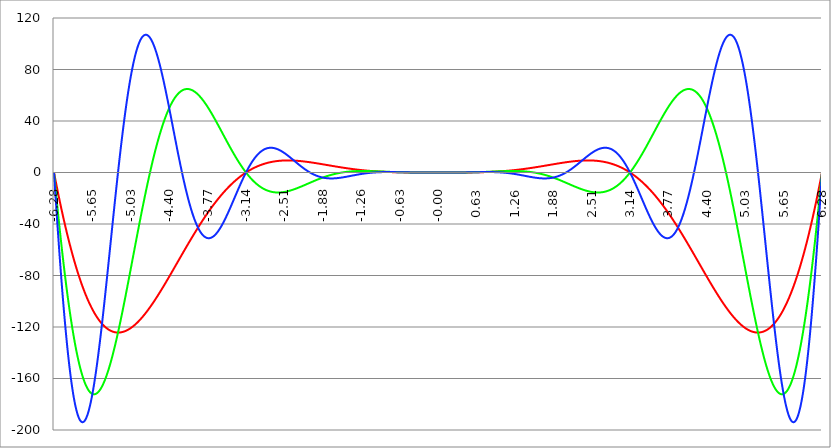
| Category | Series 1 | Series 0 | Series 2 |
|---|---|---|---|
| -6.283185307179586 | 0 | 0 | 0 |
| -6.276902121872407 | -1.554 | -3.108 | -4.661 |
| -6.270618936565228 | -3.098 | -6.196 | -9.293 |
| -6.264335751258049 | -4.633 | -9.265 | -13.894 |
| -6.25805256595087 | -6.159 | -12.314 | -18.462 |
| -6.25176938064369 | -7.675 | -15.343 | -22.995 |
| -6.245486195336511 | -9.182 | -18.351 | -27.493 |
| -6.23920301002933 | -10.679 | -21.337 | -31.954 |
| -6.232919824722153 | -12.166 | -24.302 | -36.376 |
| -6.226636639414973 | -13.644 | -27.245 | -40.759 |
| -6.220353454107794 | -15.113 | -30.166 | -45.099 |
| -6.214070268800615 | -16.571 | -33.063 | -49.398 |
| -6.207787083493435 | -18.02 | -35.938 | -53.652 |
| -6.201503898186257 | -19.459 | -38.789 | -57.86 |
| -6.195220712879077 | -20.889 | -41.617 | -62.022 |
| -6.188937527571898 | -22.309 | -44.42 | -66.136 |
| -6.182654342264719 | -23.719 | -47.198 | -70.201 |
| -6.17637115695754 | -25.119 | -49.952 | -74.215 |
| -6.170087971650361 | -26.509 | -52.68 | -78.178 |
| -6.163804786343182 | -27.89 | -55.383 | -82.088 |
| -6.157521601036002 | -29.261 | -58.06 | -85.943 |
| -6.151238415728823 | -30.621 | -60.711 | -89.744 |
| -6.144955230421644 | -31.972 | -63.335 | -93.489 |
| -6.138672045114464 | -33.313 | -65.932 | -97.176 |
| -6.132388859807286 | -34.644 | -68.502 | -100.806 |
| -6.126105674500106 | -35.965 | -71.045 | -104.376 |
| -6.119822489192927 | -37.277 | -73.561 | -107.886 |
| -6.113539303885748 | -38.578 | -76.048 | -111.335 |
| -6.107256118578569 | -39.869 | -78.507 | -114.721 |
| -6.10097293327139 | -41.15 | -80.937 | -118.045 |
| -6.09468974796421 | -42.421 | -83.339 | -121.305 |
| -6.088406562657031 | -43.682 | -85.712 | -124.501 |
| -6.082123377349852 | -44.933 | -88.056 | -127.631 |
| -6.075840192042672 | -46.174 | -90.37 | -130.694 |
| -6.069557006735494 | -47.405 | -92.654 | -133.691 |
| -6.063273821428314 | -48.625 | -94.909 | -136.621 |
| -6.056990636121135 | -49.836 | -97.133 | -139.482 |
| -6.050707450813956 | -51.037 | -99.327 | -142.274 |
| -6.044424265506777 | -52.227 | -101.491 | -144.996 |
| -6.038141080199597 | -53.407 | -103.623 | -147.648 |
| -6.031857894892418 | -54.577 | -105.725 | -150.23 |
| -6.025574709585239 | -55.737 | -107.796 | -152.74 |
| -6.01929152427806 | -56.887 | -109.835 | -155.179 |
| -6.013008338970881 | -58.027 | -111.843 | -157.545 |
| -6.006725153663701 | -59.156 | -113.82 | -159.839 |
| -6.000441968356522 | -60.275 | -115.764 | -162.06 |
| -5.994158783049343 | -61.385 | -117.677 | -164.207 |
| -5.987875597742164 | -62.483 | -119.557 | -166.281 |
| -5.981592412434984 | -63.572 | -121.406 | -168.28 |
| -5.975309227127805 | -64.651 | -123.222 | -170.205 |
| -5.969026041820626 | -65.719 | -125.005 | -172.055 |
| -5.962742856513447 | -66.778 | -126.757 | -173.831 |
| -5.956459671206268 | -67.826 | -128.475 | -175.531 |
| -5.950176485899088 | -68.863 | -130.161 | -177.156 |
| -5.94389330059191 | -69.891 | -131.813 | -178.706 |
| -5.93761011528473 | -70.909 | -133.433 | -180.181 |
| -5.931326929977551 | -71.916 | -135.02 | -181.579 |
| -5.925043744670372 | -72.913 | -136.573 | -182.903 |
| -5.918760559363193 | -73.9 | -138.094 | -184.15 |
| -5.912477374056014 | -74.877 | -139.581 | -185.322 |
| -5.906194188748834 | -75.843 | -141.035 | -186.418 |
| -5.899911003441655 | -76.8 | -142.455 | -187.439 |
| -5.893627818134476 | -77.746 | -143.842 | -188.385 |
| -5.887344632827297 | -78.682 | -145.196 | -189.255 |
| -5.881061447520117 | -79.608 | -146.516 | -190.05 |
| -5.874778262212938 | -80.524 | -147.803 | -190.77 |
| -5.868495076905759 | -81.43 | -149.056 | -191.415 |
| -5.86221189159858 | -82.326 | -150.276 | -191.985 |
| -5.855928706291401 | -83.211 | -151.462 | -192.482 |
| -5.849645520984221 | -84.087 | -152.614 | -192.904 |
| -5.843362335677042 | -84.952 | -153.734 | -193.253 |
| -5.837079150369863 | -85.807 | -154.819 | -193.528 |
| -5.830795965062684 | -86.652 | -155.871 | -193.73 |
| -5.824512779755505 | -87.487 | -156.89 | -193.86 |
| -5.818229594448325 | -88.312 | -157.875 | -193.917 |
| -5.811946409141146 | -89.127 | -158.826 | -193.903 |
| -5.805663223833967 | -89.932 | -159.745 | -193.818 |
| -5.799380038526788 | -90.727 | -160.63 | -193.661 |
| -5.793096853219609 | -91.512 | -161.481 | -193.435 |
| -5.78681366791243 | -92.287 | -162.3 | -193.138 |
| -5.780530482605251 | -93.053 | -163.085 | -192.773 |
| -5.774247297298071 | -93.808 | -163.837 | -192.338 |
| -5.767964111990892 | -94.553 | -164.557 | -191.836 |
| -5.761680926683713 | -95.288 | -165.243 | -191.267 |
| -5.755397741376534 | -96.013 | -165.896 | -190.63 |
| -5.749114556069355 | -96.729 | -166.517 | -189.928 |
| -5.742831370762175 | -97.434 | -167.105 | -189.16 |
| -5.736548185454996 | -98.13 | -167.661 | -188.328 |
| -5.730265000147816 | -98.816 | -168.184 | -187.431 |
| -5.723981814840638 | -99.492 | -168.675 | -186.472 |
| -5.717698629533459 | -100.159 | -169.133 | -185.45 |
| -5.711415444226279 | -100.815 | -169.56 | -184.366 |
| -5.7051322589191 | -101.462 | -169.955 | -183.221 |
| -5.698849073611921 | -102.099 | -170.317 | -182.017 |
| -5.692565888304742 | -102.726 | -170.648 | -180.753 |
| -5.686282702997562 | -103.344 | -170.948 | -179.431 |
| -5.679999517690383 | -103.952 | -171.216 | -178.052 |
| -5.673716332383204 | -104.551 | -171.453 | -176.616 |
| -5.667433147076025 | -105.139 | -171.659 | -175.124 |
| -5.661149961768846 | -105.719 | -171.834 | -173.578 |
| -5.654866776461667 | -106.288 | -171.978 | -171.978 |
| -5.648583591154487 | -106.849 | -172.092 | -170.325 |
| -5.642300405847308 | -107.399 | -172.175 | -168.621 |
| -5.63601722054013 | -107.94 | -172.228 | -166.865 |
| -5.62973403523295 | -108.472 | -172.251 | -165.06 |
| -5.623450849925771 | -108.994 | -172.245 | -163.206 |
| -5.617167664618591 | -109.507 | -172.208 | -161.304 |
| -5.610884479311412 | -110.01 | -172.142 | -159.355 |
| -5.604601294004233 | -110.505 | -172.047 | -157.36 |
| -5.598318108697054 | -110.989 | -171.923 | -155.321 |
| -5.592034923389875 | -111.465 | -171.77 | -153.238 |
| -5.585751738082695 | -111.931 | -171.589 | -151.112 |
| -5.579468552775516 | -112.388 | -171.379 | -148.945 |
| -5.573185367468337 | -112.836 | -171.141 | -146.738 |
| -5.566902182161157 | -113.275 | -170.875 | -144.491 |
| -5.560618996853979 | -113.704 | -170.581 | -142.206 |
| -5.5543358115468 | -114.124 | -170.26 | -139.884 |
| -5.54805262623962 | -114.536 | -169.912 | -137.526 |
| -5.54176944093244 | -114.938 | -169.536 | -135.133 |
| -5.535486255625262 | -115.331 | -169.134 | -132.706 |
| -5.529203070318083 | -115.715 | -168.706 | -130.247 |
| -5.522919885010904 | -116.091 | -168.251 | -127.756 |
| -5.516636699703724 | -116.457 | -167.77 | -125.236 |
| -5.510353514396545 | -116.814 | -167.264 | -122.686 |
| -5.504070329089366 | -117.163 | -166.731 | -120.108 |
| -5.497787143782186 | -117.503 | -166.174 | -117.503 |
| -5.491503958475008 | -117.834 | -165.592 | -114.873 |
| -5.485220773167828 | -118.156 | -164.985 | -112.218 |
| -5.47893758786065 | -118.47 | -164.354 | -109.54 |
| -5.47265440255347 | -118.775 | -163.699 | -106.839 |
| -5.466371217246291 | -119.071 | -163.019 | -104.118 |
| -5.460088031939112 | -119.359 | -162.317 | -101.377 |
| -5.453804846631932 | -119.638 | -161.591 | -98.617 |
| -5.447521661324753 | -119.908 | -160.842 | -95.84 |
| -5.441238476017574 | -120.17 | -160.07 | -93.046 |
| -5.434955290710395 | -120.424 | -159.276 | -90.238 |
| -5.428672105403215 | -120.669 | -158.46 | -87.415 |
| -5.422388920096036 | -120.906 | -157.621 | -84.58 |
| -5.416105734788857 | -121.135 | -156.762 | -81.733 |
| -5.409822549481678 | -121.355 | -155.881 | -78.875 |
| -5.403539364174499 | -121.567 | -154.979 | -76.008 |
| -5.39725617886732 | -121.771 | -154.057 | -73.133 |
| -5.39097299356014 | -121.966 | -153.114 | -70.251 |
| -5.384689808252961 | -122.153 | -152.151 | -67.363 |
| -5.378406622945782 | -122.333 | -151.169 | -64.47 |
| -5.372123437638603 | -122.504 | -150.167 | -61.573 |
| -5.365840252331424 | -122.667 | -149.146 | -58.674 |
| -5.359557067024244 | -122.822 | -148.107 | -55.773 |
| -5.353273881717065 | -122.97 | -147.048 | -52.872 |
| -5.346990696409886 | -123.109 | -145.972 | -49.972 |
| -5.340707511102707 | -123.241 | -144.878 | -47.074 |
| -5.334424325795528 | -123.364 | -143.767 | -44.178 |
| -5.328141140488348 | -123.48 | -142.638 | -41.287 |
| -5.32185795518117 | -123.589 | -141.492 | -38.401 |
| -5.31557476987399 | -123.689 | -140.33 | -35.521 |
| -5.30929158456681 | -123.782 | -139.152 | -32.648 |
| -5.303008399259631 | -123.867 | -137.957 | -29.783 |
| -5.296725213952453 | -123.945 | -136.748 | -26.927 |
| -5.290442028645273 | -124.015 | -135.523 | -24.082 |
| -5.284158843338094 | -124.078 | -134.283 | -21.248 |
| -5.277875658030915 | -124.133 | -133.028 | -18.427 |
| -5.271592472723735 | -124.181 | -131.759 | -15.618 |
| -5.265309287416557 | -124.222 | -130.476 | -12.824 |
| -5.259026102109377 | -124.255 | -129.18 | -10.045 |
| -5.252742916802198 | -124.281 | -127.871 | -7.282 |
| -5.246459731495019 | -124.3 | -126.548 | -4.536 |
| -5.24017654618784 | -124.312 | -125.213 | -1.808 |
| -5.23389336088066 | -124.317 | -123.865 | 0.901 |
| -5.227610175573481 | -124.314 | -122.506 | 3.59 |
| -5.221326990266302 | -124.305 | -121.135 | 6.259 |
| -5.215043804959122 | -124.288 | -119.753 | 8.906 |
| -5.208760619651944 | -124.265 | -118.359 | 11.53 |
| -5.202477434344764 | -124.235 | -116.955 | 14.132 |
| -5.196194249037585 | -124.198 | -115.541 | 16.709 |
| -5.189911063730406 | -124.154 | -114.117 | 19.262 |
| -5.183627878423227 | -124.103 | -112.683 | 21.789 |
| -5.177344693116048 | -124.046 | -111.24 | 24.289 |
| -5.171061507808868 | -123.982 | -109.788 | 26.763 |
| -5.164778322501689 | -123.911 | -108.327 | 29.208 |
| -5.15849513719451 | -123.834 | -106.858 | 31.625 |
| -5.152211951887331 | -123.75 | -105.381 | 34.013 |
| -5.145928766580152 | -123.66 | -103.896 | 36.37 |
| -5.139645581272972 | -123.564 | -102.404 | 38.697 |
| -5.133362395965793 | -123.461 | -100.904 | 40.992 |
| -5.127079210658614 | -123.352 | -99.398 | 43.255 |
| -5.120796025351435 | -123.236 | -97.886 | 45.486 |
| -5.114512840044256 | -123.115 | -96.368 | 47.683 |
| -5.108229654737076 | -122.987 | -94.844 | 49.847 |
| -5.101946469429897 | -122.853 | -93.314 | 51.976 |
| -5.095663284122718 | -122.713 | -91.779 | 54.07 |
| -5.08938009881554 | -122.567 | -90.24 | 56.128 |
| -5.08309691350836 | -122.415 | -88.696 | 58.15 |
| -5.07681372820118 | -122.257 | -87.148 | 60.136 |
| -5.070530542894002 | -122.093 | -85.596 | 62.085 |
| -5.064247357586822 | -121.923 | -84.04 | 63.996 |
| -5.057964172279643 | -121.748 | -82.481 | 65.869 |
| -5.051680986972464 | -121.567 | -80.92 | 67.704 |
| -5.045397801665285 | -121.38 | -79.355 | 69.499 |
| -5.039114616358106 | -121.187 | -77.789 | 71.256 |
| -5.032831431050926 | -120.989 | -76.22 | 72.973 |
| -5.026548245743747 | -120.786 | -74.65 | 74.65 |
| -5.020265060436568 | -120.577 | -73.078 | 76.286 |
| -5.013981875129389 | -120.362 | -71.505 | 77.882 |
| -5.00769868982221 | -120.142 | -69.931 | 79.437 |
| -5.00141550451503 | -119.917 | -68.357 | 80.951 |
| -4.995132319207851 | -119.686 | -66.783 | 82.423 |
| -4.98884913390067 | -119.451 | -65.209 | 83.853 |
| -4.982565948593493 | -119.21 | -63.635 | 85.241 |
| -4.976282763286313 | -118.964 | -62.061 | 86.587 |
| -4.969999577979134 | -118.712 | -60.489 | 87.891 |
| -4.963716392671955 | -118.456 | -58.918 | 89.152 |
| -4.957433207364776 | -118.195 | -57.348 | 90.37 |
| -4.951150022057597 | -117.929 | -55.78 | 91.545 |
| -4.944866836750418 | -117.658 | -54.214 | 92.677 |
| -4.938583651443238 | -117.382 | -52.651 | 93.766 |
| -4.932300466136059 | -117.101 | -51.09 | 94.811 |
| -4.92601728082888 | -116.816 | -49.532 | 95.814 |
| -4.9197340955217 | -116.526 | -47.977 | 96.773 |
| -4.913450910214521 | -116.231 | -46.425 | 97.688 |
| -4.907167724907342 | -115.932 | -44.877 | 98.56 |
| -4.900884539600163 | -115.628 | -43.333 | 99.388 |
| -4.894601354292984 | -115.319 | -41.793 | 100.173 |
| -4.888318168985805 | -115.007 | -40.258 | 100.915 |
| -4.882034983678625 | -114.689 | -38.727 | 101.613 |
| -4.875751798371446 | -114.368 | -37.201 | 102.267 |
| -4.869468613064267 | -114.042 | -35.68 | 102.879 |
| -4.863185427757088 | -113.712 | -34.165 | 103.447 |
| -4.856902242449909 | -113.378 | -32.655 | 103.972 |
| -4.85061905714273 | -113.039 | -31.151 | 104.454 |
| -4.84433587183555 | -112.697 | -29.654 | 104.894 |
| -4.838052686528371 | -112.35 | -28.162 | 105.291 |
| -4.831769501221192 | -112 | -26.678 | 105.645 |
| -4.825486315914013 | -111.645 | -25.2 | 105.957 |
| -4.819203130606833 | -111.287 | -23.729 | 106.227 |
| -4.812919945299654 | -110.925 | -22.265 | 106.455 |
| -4.806636759992475 | -110.559 | -20.809 | 106.642 |
| -4.800353574685296 | -110.189 | -19.36 | 106.787 |
| -4.794070389378117 | -109.815 | -17.92 | 106.891 |
| -4.787787204070938 | -109.438 | -16.487 | 106.954 |
| -4.781504018763758 | -109.057 | -15.063 | 106.977 |
| -4.77522083345658 | -108.673 | -13.647 | 106.959 |
| -4.7689376481494 | -108.285 | -12.24 | 106.902 |
| -4.762654462842221 | -107.894 | -10.842 | 106.805 |
| -4.756371277535042 | -107.5 | -9.453 | 106.668 |
| -4.750088092227862 | -107.102 | -8.073 | 106.493 |
| -4.743804906920683 | -106.7 | -6.703 | 106.279 |
| -4.737521721613504 | -106.296 | -5.342 | 106.027 |
| -4.731238536306324 | -105.888 | -3.992 | 105.738 |
| -4.724955350999146 | -105.477 | -2.651 | 105.411 |
| -4.718672165691966 | -105.063 | -1.32 | 105.047 |
| -4.712388980384787 | -104.646 | 0 | 104.646 |
| -4.706105795077608 | -104.226 | 1.31 | 104.21 |
| -4.699822609770429 | -103.803 | 2.609 | 103.737 |
| -4.69353942446325 | -103.377 | 3.897 | 103.23 |
| -4.68725623915607 | -102.948 | 5.174 | 102.688 |
| -4.680973053848891 | -102.517 | 6.44 | 102.112 |
| -4.674689868541712 | -102.082 | 7.695 | 101.502 |
| -4.668406683234533 | -101.645 | 8.938 | 100.859 |
| -4.662123497927354 | -101.205 | 10.17 | 100.183 |
| -4.655840312620174 | -100.763 | 11.39 | 99.475 |
| -4.649557127312995 | -100.318 | 12.598 | 98.735 |
| -4.643273942005816 | -99.87 | 13.794 | 97.965 |
| -4.636990756698637 | -99.42 | 14.978 | 97.163 |
| -4.630707571391458 | -98.967 | 16.15 | 96.332 |
| -4.624424386084279 | -98.512 | 17.309 | 95.471 |
| -4.618141200777099 | -98.055 | 18.456 | 94.581 |
| -4.61185801546992 | -97.595 | 19.59 | 93.663 |
| -4.605574830162741 | -97.134 | 20.711 | 92.718 |
| -4.599291644855561 | -96.669 | 21.82 | 91.745 |
| -4.593008459548383 | -96.203 | 22.915 | 90.745 |
| -4.586725274241203 | -95.735 | 23.998 | 89.719 |
| -4.580442088934024 | -95.264 | 25.067 | 88.669 |
| -4.574158903626845 | -94.792 | 26.123 | 87.593 |
| -4.567875718319666 | -94.317 | 27.165 | 86.493 |
| -4.561592533012487 | -93.841 | 28.195 | 85.37 |
| -4.555309347705307 | -93.363 | 29.21 | 84.224 |
| -4.549026162398128 | -92.883 | 30.212 | 83.055 |
| -4.542742977090949 | -92.401 | 31.201 | 81.865 |
| -4.53645979178377 | -91.917 | 32.175 | 80.654 |
| -4.530176606476591 | -91.431 | 33.136 | 79.423 |
| -4.523893421169412 | -90.944 | 34.083 | 78.171 |
| -4.517610235862232 | -90.456 | 35.015 | 76.901 |
| -4.511327050555053 | -89.965 | 35.934 | 75.613 |
| -4.505043865247874 | -89.473 | 36.838 | 74.306 |
| -4.498760679940694 | -88.98 | 37.729 | 72.982 |
| -4.492477494633515 | -88.485 | 38.605 | 71.642 |
| -4.486194309326336 | -87.989 | 39.467 | 70.286 |
| -4.479911124019157 | -87.491 | 40.314 | 68.915 |
| -4.473627938711977 | -86.992 | 41.147 | 67.53 |
| -4.467344753404799 | -86.492 | 41.966 | 66.13 |
| -4.46106156809762 | -85.991 | 42.77 | 64.718 |
| -4.45477838279044 | -85.488 | 43.56 | 63.293 |
| -4.44849519748326 | -84.984 | 44.335 | 61.856 |
| -4.442212012176082 | -84.479 | 45.095 | 60.407 |
| -4.435928826868903 | -83.973 | 45.841 | 58.948 |
| -4.429645641561723 | -83.466 | 46.573 | 57.48 |
| -4.423362456254544 | -82.958 | 47.289 | 56.001 |
| -4.417079270947365 | -82.449 | 47.991 | 54.515 |
| -4.410796085640185 | -81.939 | 48.679 | 53.02 |
| -4.404512900333007 | -81.429 | 49.351 | 51.518 |
| -4.398229715025827 | -80.917 | 50.009 | 50.009 |
| -4.391946529718648 | -80.405 | 50.653 | 48.495 |
| -4.38566334441147 | -79.892 | 51.281 | 46.975 |
| -4.37938015910429 | -79.378 | 51.895 | 45.45 |
| -4.373096973797111 | -78.863 | 52.494 | 43.921 |
| -4.366813788489932 | -78.348 | 53.079 | 42.388 |
| -4.360530603182752 | -77.832 | 53.649 | 40.853 |
| -4.354247417875573 | -77.316 | 54.204 | 39.315 |
| -4.347964232568394 | -76.799 | 54.744 | 37.776 |
| -4.341681047261215 | -76.282 | 55.27 | 36.236 |
| -4.335397861954035 | -75.764 | 55.782 | 34.695 |
| -4.329114676646856 | -75.246 | 56.278 | 33.155 |
| -4.322831491339677 | -74.728 | 56.76 | 31.615 |
| -4.316548306032498 | -74.209 | 57.228 | 30.077 |
| -4.310265120725319 | -73.69 | 57.681 | 28.541 |
| -4.30398193541814 | -73.171 | 58.119 | 27.007 |
| -4.29769875011096 | -72.651 | 58.543 | 25.476 |
| -4.291415564803781 | -72.132 | 58.953 | 23.949 |
| -4.285132379496602 | -71.612 | 59.348 | 22.427 |
| -4.278849194189422 | -71.092 | 59.729 | 20.909 |
| -4.272566008882244 | -70.572 | 60.096 | 19.397 |
| -4.266282823575064 | -70.052 | 60.449 | 17.89 |
| -4.259999638267885 | -69.532 | 60.787 | 16.39 |
| -4.253716452960706 | -69.012 | 61.111 | 14.897 |
| -4.247433267653527 | -68.492 | 61.421 | 13.411 |
| -4.241150082346347 | -67.972 | 61.718 | 11.934 |
| -4.234866897039168 | -67.453 | 62 | 10.465 |
| -4.228583711731989 | -66.933 | 62.268 | 9.005 |
| -4.22230052642481 | -66.414 | 62.523 | 7.555 |
| -4.216017341117631 | -65.895 | 62.763 | 6.114 |
| -4.209734155810452 | -65.376 | 62.991 | 4.684 |
| -4.203450970503273 | -64.858 | 63.204 | 3.266 |
| -4.197167785196093 | -64.34 | 63.404 | 1.858 |
| -4.190884599888914 | -63.822 | 63.591 | 0.462 |
| -4.184601414581734 | -63.305 | 63.764 | -0.921 |
| -4.178318229274556 | -62.788 | 63.924 | -2.291 |
| -4.172035043967377 | -62.272 | 64.07 | -3.649 |
| -4.165751858660197 | -61.756 | 64.204 | -4.992 |
| -4.159468673353018 | -61.241 | 64.324 | -6.322 |
| -4.153185488045839 | -60.726 | 64.432 | -7.637 |
| -4.14690230273866 | -60.212 | 64.526 | -8.938 |
| -4.140619117431481 | -59.698 | 64.608 | -10.223 |
| -4.134335932124301 | -59.186 | 64.677 | -11.493 |
| -4.128052746817122 | -58.674 | 64.734 | -12.747 |
| -4.121769561509943 | -58.162 | 64.778 | -13.985 |
| -4.115486376202764 | -57.652 | 64.81 | -15.206 |
| -4.109203190895584 | -57.142 | 64.829 | -16.41 |
| -4.102920005588405 | -56.633 | 64.837 | -17.597 |
| -4.096636820281226 | -56.125 | 64.832 | -18.766 |
| -4.090353634974047 | -55.617 | 64.815 | -19.917 |
| -4.084070449666868 | -55.111 | 64.787 | -21.05 |
| -4.077787264359689 | -54.605 | 64.746 | -22.165 |
| -4.071504079052509 | -54.101 | 64.694 | -23.261 |
| -4.06522089374533 | -53.597 | 64.631 | -24.338 |
| -4.058937708438151 | -53.095 | 64.556 | -25.396 |
| -4.052654523130972 | -52.593 | 64.47 | -26.434 |
| -4.046371337823793 | -52.093 | 64.372 | -27.453 |
| -4.040088152516613 | -51.594 | 64.264 | -28.452 |
| -4.033804967209434 | -51.095 | 64.144 | -29.43 |
| -4.027521781902255 | -50.598 | 64.014 | -30.388 |
| -4.021238596595076 | -50.103 | 63.873 | -31.326 |
| -4.014955411287897 | -49.608 | 63.722 | -32.243 |
| -4.008672225980717 | -49.114 | 63.56 | -33.139 |
| -4.002389040673538 | -48.622 | 63.387 | -34.014 |
| -3.996105855366359 | -48.131 | 63.205 | -34.867 |
| -3.989822670059179 | -47.642 | 63.012 | -35.699 |
| -3.983539484752 | -47.153 | 62.809 | -36.51 |
| -3.97725629944482 | -46.666 | 62.597 | -37.299 |
| -3.97097311413764 | -46.181 | 62.375 | -38.067 |
| -3.96468992883046 | -45.696 | 62.143 | -38.812 |
| -3.958406743523281 | -45.214 | 61.902 | -39.536 |
| -3.952123558216101 | -44.732 | 61.651 | -40.237 |
| -3.945840372908922 | -44.252 | 61.392 | -40.917 |
| -3.939557187601742 | -43.774 | 61.123 | -41.574 |
| -3.933274002294562 | -43.297 | 60.845 | -42.209 |
| -3.926990816987382 | -42.822 | 60.559 | -42.822 |
| -3.920707631680203 | -42.348 | 60.264 | -43.412 |
| -3.914424446373023 | -41.876 | 59.961 | -43.98 |
| -3.908141261065844 | -41.405 | 59.649 | -44.526 |
| -3.901858075758664 | -40.936 | 59.329 | -45.05 |
| -3.895574890451484 | -40.469 | 59.001 | -45.551 |
| -3.889291705144305 | -40.003 | 58.665 | -46.029 |
| -3.883008519837125 | -39.539 | 58.321 | -46.486 |
| -3.876725334529945 | -39.076 | 57.969 | -46.92 |
| -3.870442149222766 | -38.616 | 57.61 | -47.332 |
| -3.864158963915586 | -38.157 | 57.244 | -47.721 |
| -3.857875778608407 | -37.7 | 56.87 | -48.089 |
| -3.851592593301227 | -37.244 | 56.489 | -48.434 |
| -3.845309407994047 | -36.791 | 56.101 | -48.758 |
| -3.839026222686868 | -36.339 | 55.707 | -49.059 |
| -3.832743037379688 | -35.889 | 55.305 | -49.338 |
| -3.826459852072508 | -35.441 | 54.898 | -49.596 |
| -3.820176666765329 | -34.994 | 54.483 | -49.832 |
| -3.813893481458149 | -34.55 | 54.063 | -50.047 |
| -3.807610296150969 | -34.107 | 53.636 | -50.24 |
| -3.80132711084379 | -33.667 | 53.204 | -50.412 |
| -3.79504392553661 | -33.228 | 52.765 | -50.562 |
| -3.78876074022943 | -32.791 | 52.321 | -50.692 |
| -3.782477554922251 | -32.356 | 51.872 | -50.801 |
| -3.776194369615071 | -31.924 | 51.417 | -50.889 |
| -3.769911184307892 | -31.493 | 50.957 | -50.957 |
| -3.763627999000712 | -31.064 | 50.491 | -51.004 |
| -3.757344813693532 | -30.637 | 50.021 | -51.031 |
| -3.751061628386352 | -30.212 | 49.546 | -51.038 |
| -3.744778443079173 | -29.79 | 49.066 | -51.025 |
| -3.738495257771993 | -29.369 | 48.581 | -50.992 |
| -3.732212072464814 | -28.951 | 48.092 | -50.94 |
| -3.725928887157634 | -28.534 | 47.599 | -50.869 |
| -3.719645701850454 | -28.12 | 47.102 | -50.779 |
| -3.713362516543275 | -27.707 | 46.601 | -50.67 |
| -3.707079331236095 | -27.297 | 46.096 | -50.543 |
| -3.700796145928915 | -26.889 | 45.587 | -50.397 |
| -3.694512960621736 | -26.483 | 45.075 | -50.233 |
| -3.688229775314556 | -26.08 | 44.559 | -50.051 |
| -3.681946590007376 | -25.678 | 44.04 | -49.852 |
| -3.675663404700197 | -25.279 | 43.517 | -49.636 |
| -3.669380219393017 | -24.882 | 42.992 | -49.402 |
| -3.663097034085838 | -24.487 | 42.464 | -49.151 |
| -3.656813848778658 | -24.094 | 41.933 | -48.885 |
| -3.650530663471478 | -23.704 | 41.399 | -48.601 |
| -3.644247478164299 | -23.316 | 40.863 | -48.302 |
| -3.63796429285712 | -22.93 | 40.325 | -47.987 |
| -3.631681107549939 | -22.546 | 39.784 | -47.657 |
| -3.62539792224276 | -22.165 | 39.242 | -47.311 |
| -3.61911473693558 | -21.786 | 38.697 | -46.951 |
| -3.612831551628401 | -21.409 | 38.151 | -46.576 |
| -3.606548366321221 | -21.034 | 37.602 | -46.187 |
| -3.600265181014041 | -20.662 | 37.053 | -45.784 |
| -3.593981995706862 | -20.292 | 36.501 | -45.367 |
| -3.587698810399682 | -19.924 | 35.949 | -44.937 |
| -3.581415625092502 | -19.559 | 35.395 | -44.494 |
| -3.575132439785323 | -19.196 | 34.84 | -44.038 |
| -3.568849254478143 | -18.836 | 34.285 | -43.57 |
| -3.562566069170964 | -18.477 | 33.728 | -43.09 |
| -3.556282883863784 | -18.121 | 33.171 | -42.597 |
| -3.549999698556604 | -17.768 | 32.613 | -42.094 |
| -3.543716513249425 | -17.417 | 32.055 | -41.579 |
| -3.537433327942245 | -17.068 | 31.496 | -41.054 |
| -3.531150142635065 | -16.722 | 30.938 | -40.518 |
| -3.524866957327886 | -16.378 | 30.379 | -39.972 |
| -3.518583772020706 | -16.036 | 29.82 | -39.416 |
| -3.512300586713526 | -15.697 | 29.261 | -38.85 |
| -3.506017401406347 | -15.36 | 28.703 | -38.276 |
| -3.499734216099167 | -15.026 | 28.145 | -37.692 |
| -3.493451030791987 | -14.694 | 27.587 | -37.1 |
| -3.487167845484808 | -14.364 | 27.03 | -36.5 |
| -3.480884660177628 | -14.037 | 26.474 | -35.892 |
| -3.474601474870449 | -13.712 | 25.918 | -35.276 |
| -3.468318289563269 | -13.39 | 25.364 | -34.653 |
| -3.462035104256089 | -13.07 | 24.81 | -34.024 |
| -3.45575191894891 | -12.753 | 24.258 | -33.388 |
| -3.44946873364173 | -12.438 | 23.706 | -32.745 |
| -3.44318554833455 | -12.125 | 23.156 | -32.097 |
| -3.436902363027371 | -11.815 | 22.608 | -31.443 |
| -3.430619177720191 | -11.508 | 22.061 | -30.784 |
| -3.424335992413011 | -11.203 | 21.516 | -30.12 |
| -3.418052807105832 | -10.9 | 20.972 | -29.451 |
| -3.411769621798652 | -10.6 | 20.43 | -28.779 |
| -3.405486436491473 | -10.302 | 19.89 | -28.102 |
| -3.399203251184293 | -10.006 | 19.353 | -27.421 |
| -3.392920065877113 | -9.714 | 18.817 | -26.738 |
| -3.386636880569934 | -9.423 | 18.283 | -26.051 |
| -3.380353695262754 | -9.135 | 17.752 | -25.362 |
| -3.374070509955574 | -8.85 | 17.223 | -24.67 |
| -3.367787324648395 | -8.567 | 16.697 | -23.976 |
| -3.361504139341215 | -8.286 | 16.173 | -23.281 |
| -3.355220954034035 | -8.008 | 15.652 | -22.584 |
| -3.348937768726855 | -7.732 | 15.133 | -21.886 |
| -3.342654583419676 | -7.459 | 14.617 | -21.187 |
| -3.336371398112496 | -7.188 | 14.104 | -20.487 |
| -3.330088212805317 | -6.92 | 13.594 | -19.788 |
| -3.323805027498137 | -6.654 | 13.088 | -19.088 |
| -3.317521842190957 | -6.391 | 12.584 | -18.389 |
| -3.311238656883778 | -6.13 | 12.083 | -17.69 |
| -3.304955471576598 | -5.871 | 11.586 | -16.992 |
| -3.298672286269419 | -5.615 | 11.092 | -16.295 |
| -3.292389100962239 | -5.361 | 10.601 | -15.6 |
| -3.286105915655059 | -5.11 | 10.114 | -14.907 |
| -3.27982273034788 | -4.861 | 9.63 | -14.215 |
| -3.2735395450407 | -4.615 | 9.15 | -13.526 |
| -3.26725635973352 | -4.371 | 8.674 | -12.839 |
| -3.260973174426341 | -4.13 | 8.201 | -12.155 |
| -3.254689989119161 | -3.891 | 7.732 | -11.475 |
| -3.248406803811982 | -3.654 | 7.267 | -10.797 |
| -3.242123618504802 | -3.42 | 6.806 | -10.123 |
| -3.235840433197622 | -3.189 | 6.349 | -9.453 |
| -3.229557247890442 | -2.959 | 5.896 | -8.786 |
| -3.223274062583263 | -2.732 | 5.446 | -8.124 |
| -3.216990877276083 | -2.508 | 5.001 | -7.467 |
| -3.210707691968904 | -2.286 | 4.561 | -6.814 |
| -3.204424506661724 | -2.066 | 4.124 | -6.166 |
| -3.198141321354544 | -1.849 | 3.692 | -5.523 |
| -3.191858136047365 | -1.634 | 3.264 | -4.885 |
| -3.185574950740185 | -1.421 | 2.84 | -4.253 |
| -3.179291765433005 | -1.211 | 2.421 | -3.627 |
| -3.173008580125826 | -1.003 | 2.006 | -3.006 |
| -3.166725394818646 | -0.798 | 1.596 | -2.392 |
| -3.160442209511467 | -0.595 | 1.19 | -1.784 |
| -3.154159024204287 | -0.394 | 0.789 | -1.183 |
| -3.147875838897107 | -0.196 | 0.392 | -0.588 |
| -3.141592653589928 | 0 | 0 | 0 |
| -3.135309468282748 | 0.194 | -0.387 | 0.581 |
| -3.129026282975568 | 0.385 | -0.77 | 1.155 |
| -3.122743097668389 | 0.574 | -1.148 | 1.721 |
| -3.116459912361209 | 0.761 | -1.521 | 2.28 |
| -3.110176727054029 | 0.945 | -1.889 | 2.831 |
| -3.10389354174685 | 1.127 | -2.253 | 3.375 |
| -3.09761035643967 | 1.307 | -2.611 | 3.91 |
| -3.09132717113249 | 1.484 | -2.965 | 4.438 |
| -3.085043985825311 | 1.659 | -3.314 | 4.957 |
| -3.078760800518131 | 1.832 | -3.658 | 5.468 |
| -3.072477615210952 | 2.003 | -3.997 | 5.971 |
| -3.066194429903772 | 2.171 | -4.331 | 6.465 |
| -3.059911244596592 | 2.338 | -4.66 | 6.95 |
| -3.053628059289413 | 2.501 | -4.984 | 7.427 |
| -3.047344873982233 | 2.663 | -5.303 | 7.895 |
| -3.041061688675053 | 2.823 | -5.617 | 8.354 |
| -3.034778503367874 | 2.98 | -5.926 | 8.804 |
| -3.028495318060694 | 3.135 | -6.23 | 9.245 |
| -3.022212132753515 | 3.288 | -6.528 | 9.676 |
| -3.015928947446335 | 3.438 | -6.822 | 10.099 |
| -3.009645762139155 | 3.587 | -7.111 | 10.512 |
| -3.003362576831975 | 3.733 | -7.395 | 10.915 |
| -2.997079391524796 | 3.877 | -7.673 | 11.309 |
| -2.990796206217616 | 4.019 | -7.947 | 11.694 |
| -2.984513020910436 | 4.159 | -8.215 | 12.069 |
| -2.978229835603257 | 4.296 | -8.478 | 12.434 |
| -2.971946650296077 | 4.432 | -8.736 | 12.79 |
| -2.965663464988898 | 4.565 | -8.989 | 13.136 |
| -2.959380279681718 | 4.697 | -9.238 | 13.473 |
| -2.953097094374538 | 4.826 | -9.48 | 13.799 |
| -2.946813909067359 | 4.953 | -9.718 | 14.116 |
| -2.94053072376018 | 5.078 | -9.951 | 14.423 |
| -2.934247538453 | 5.201 | -10.179 | 14.721 |
| -2.92796435314582 | 5.322 | -10.401 | 15.008 |
| -2.92168116783864 | 5.441 | -10.619 | 15.286 |
| -2.915397982531461 | 5.557 | -10.832 | 15.554 |
| -2.909114797224281 | 5.672 | -11.039 | 15.812 |
| -2.902831611917101 | 5.785 | -11.242 | 16.06 |
| -2.896548426609922 | 5.896 | -11.439 | 16.299 |
| -2.890265241302742 | 6.004 | -11.632 | 16.528 |
| -2.883982055995562 | 6.111 | -11.819 | 16.747 |
| -2.877698870688383 | 6.216 | -12.002 | 16.956 |
| -2.871415685381203 | 6.319 | -12.179 | 17.156 |
| -2.865132500074023 | 6.42 | -12.352 | 17.346 |
| -2.858849314766844 | 6.519 | -12.52 | 17.527 |
| -2.852566129459664 | 6.616 | -12.683 | 17.698 |
| -2.846282944152485 | 6.711 | -12.841 | 17.859 |
| -2.839999758845305 | 6.804 | -12.994 | 18.011 |
| -2.833716573538125 | 6.895 | -13.142 | 18.153 |
| -2.827433388230946 | 6.985 | -13.286 | 18.287 |
| -2.821150202923766 | 7.072 | -13.425 | 18.411 |
| -2.814867017616586 | 7.158 | -13.559 | 18.525 |
| -2.808583832309407 | 7.242 | -13.688 | 18.631 |
| -2.802300647002227 | 7.324 | -13.813 | 18.727 |
| -2.796017461695047 | 7.404 | -13.933 | 18.814 |
| -2.789734276387867 | 7.483 | -14.049 | 18.893 |
| -2.783451091080688 | 7.559 | -14.159 | 18.963 |
| -2.777167905773509 | 7.634 | -14.266 | 19.023 |
| -2.770884720466329 | 7.707 | -14.367 | 19.075 |
| -2.764601535159149 | 7.778 | -14.464 | 19.119 |
| -2.75831834985197 | 7.848 | -14.557 | 19.154 |
| -2.75203516454479 | 7.916 | -14.645 | 19.18 |
| -2.74575197923761 | 7.982 | -14.729 | 19.199 |
| -2.739468793930431 | 8.046 | -14.809 | 19.209 |
| -2.733185608623251 | 8.109 | -14.884 | 19.211 |
| -2.726902423316071 | 8.17 | -14.955 | 19.205 |
| -2.720619238008892 | 8.229 | -15.021 | 19.191 |
| -2.714336052701712 | 8.287 | -15.084 | 19.169 |
| -2.708052867394532 | 8.343 | -15.142 | 19.139 |
| -2.701769682087352 | 8.397 | -15.196 | 19.102 |
| -2.695486496780173 | 8.45 | -15.246 | 19.058 |
| -2.689203311472993 | 8.501 | -15.292 | 19.006 |
| -2.682920126165814 | 8.55 | -15.333 | 18.947 |
| -2.676636940858634 | 8.598 | -15.371 | 18.88 |
| -2.670353755551454 | 8.645 | -15.405 | 18.807 |
| -2.664070570244275 | 8.69 | -15.435 | 18.727 |
| -2.657787384937095 | 8.733 | -15.461 | 18.641 |
| -2.651504199629916 | 8.775 | -15.483 | 18.547 |
| -2.645221014322736 | 8.815 | -15.502 | 18.447 |
| -2.638937829015556 | 8.853 | -15.517 | 18.341 |
| -2.632654643708377 | 8.891 | -15.528 | 18.229 |
| -2.626371458401197 | 8.926 | -15.535 | 18.111 |
| -2.620088273094018 | 8.961 | -15.539 | 17.986 |
| -2.613805087786838 | 8.993 | -15.539 | 17.856 |
| -2.607521902479658 | 9.025 | -15.536 | 17.72 |
| -2.601238717172478 | 9.055 | -15.529 | 17.579 |
| -2.594955531865299 | 9.083 | -15.519 | 17.432 |
| -2.588672346558119 | 9.11 | -15.506 | 17.28 |
| -2.58238916125094 | 9.136 | -15.489 | 17.123 |
| -2.57610597594376 | 9.16 | -15.469 | 16.961 |
| -2.56982279063658 | 9.183 | -15.445 | 16.794 |
| -2.563539605329401 | 9.205 | -15.419 | 16.623 |
| -2.557256420022221 | 9.225 | -15.389 | 16.446 |
| -2.550973234715042 | 9.244 | -15.357 | 16.266 |
| -2.544690049407862 | 9.262 | -15.321 | 16.081 |
| -2.538406864100682 | 9.278 | -15.282 | 15.892 |
| -2.532123678793503 | 9.293 | -15.24 | 15.699 |
| -2.525840493486323 | 9.307 | -15.196 | 15.503 |
| -2.519557308179143 | 9.32 | -15.148 | 15.302 |
| -2.513274122871964 | 9.331 | -15.098 | 15.098 |
| -2.506990937564784 | 9.341 | -15.045 | 14.891 |
| -2.500707752257604 | 9.35 | -14.99 | 14.68 |
| -2.494424566950425 | 9.358 | -14.931 | 14.466 |
| -2.488141381643245 | 9.364 | -14.87 | 14.25 |
| -2.481858196336065 | 9.37 | -14.807 | 14.03 |
| -2.475575011028886 | 9.374 | -14.741 | 13.808 |
| -2.469291825721706 | 9.377 | -14.673 | 13.583 |
| -2.463008640414527 | 9.379 | -14.602 | 13.355 |
| -2.456725455107347 | 9.379 | -14.529 | 13.126 |
| -2.450442269800167 | 9.379 | -14.453 | 12.894 |
| -2.444159084492988 | 9.378 | -14.376 | 12.66 |
| -2.437875899185808 | 9.375 | -14.296 | 12.425 |
| -2.431592713878628 | 9.372 | -14.214 | 12.187 |
| -2.425309528571449 | 9.367 | -14.13 | 11.948 |
| -2.419026343264269 | 9.361 | -14.044 | 11.708 |
| -2.412743157957089 | 9.354 | -13.956 | 11.466 |
| -2.40645997264991 | 9.347 | -13.866 | 11.223 |
| -2.40017678734273 | 9.338 | -13.774 | 10.979 |
| -2.393893602035551 | 9.328 | -13.68 | 10.733 |
| -2.387610416728371 | 9.317 | -13.584 | 10.487 |
| -2.381327231421191 | 9.306 | -13.487 | 10.241 |
| -2.375044046114012 | 9.293 | -13.388 | 9.994 |
| -2.368760860806832 | 9.279 | -13.287 | 9.746 |
| -2.362477675499652 | 9.265 | -13.185 | 9.498 |
| -2.356194490192473 | 9.25 | -13.081 | 9.25 |
| -2.349911304885293 | 9.233 | -12.975 | 9.001 |
| -2.343628119578113 | 9.216 | -12.869 | 8.753 |
| -2.337344934270934 | 9.198 | -12.76 | 8.505 |
| -2.331061748963754 | 9.179 | -12.651 | 8.257 |
| -2.324778563656574 | 9.159 | -12.54 | 8.009 |
| -2.318495378349395 | 9.138 | -12.427 | 7.762 |
| -2.312212193042215 | 9.117 | -12.314 | 7.515 |
| -2.305929007735036 | 9.095 | -12.199 | 7.269 |
| -2.299645822427856 | 9.072 | -12.084 | 7.024 |
| -2.293362637120676 | 9.048 | -11.967 | 6.78 |
| -2.287079451813496 | 9.023 | -11.849 | 6.537 |
| -2.280796266506317 | 8.998 | -11.73 | 6.294 |
| -2.274513081199137 | 8.972 | -11.61 | 6.053 |
| -2.268229895891957 | 8.945 | -11.49 | 5.814 |
| -2.261946710584778 | 8.917 | -11.368 | 5.575 |
| -2.255663525277598 | 8.889 | -11.246 | 5.338 |
| -2.249380339970419 | 8.86 | -11.123 | 5.103 |
| -2.24309715466324 | 8.83 | -10.999 | 4.869 |
| -2.23681396935606 | 8.8 | -10.874 | 4.637 |
| -2.23053078404888 | 8.769 | -10.749 | 4.407 |
| -2.2242475987417 | 8.737 | -10.623 | 4.179 |
| -2.217964413434521 | 8.705 | -10.497 | 3.953 |
| -2.211681228127341 | 8.672 | -10.37 | 3.729 |
| -2.205398042820161 | 8.638 | -10.242 | 3.506 |
| -2.199114857512981 | 8.604 | -10.115 | 3.286 |
| -2.192831672205802 | 8.569 | -9.986 | 3.069 |
| -2.186548486898622 | 8.534 | -9.858 | 2.853 |
| -2.180265301591443 | 8.498 | -9.729 | 2.64 |
| -2.173982116284263 | 8.462 | -9.6 | 2.43 |
| -2.167698930977084 | 8.425 | -9.471 | 2.222 |
| -2.161415745669904 | 8.387 | -9.341 | 2.017 |
| -2.155132560362724 | 8.349 | -9.211 | 1.814 |
| -2.148849375055545 | 8.31 | -9.081 | 1.614 |
| -2.142566189748365 | 8.271 | -8.951 | 1.416 |
| -2.136283004441185 | 8.232 | -8.821 | 1.222 |
| -2.129999819134006 | 8.192 | -8.691 | 1.03 |
| -2.123716633826826 | 8.151 | -8.562 | 0.841 |
| -2.117433448519646 | 8.11 | -8.432 | 0.656 |
| -2.111150263212467 | 8.069 | -8.302 | 0.473 |
| -2.104867077905287 | 8.027 | -8.172 | 0.293 |
| -2.098583892598107 | 7.985 | -8.042 | 0.116 |
| -2.092300707290928 | 7.942 | -7.913 | -0.058 |
| -2.086017521983748 | 7.899 | -7.784 | -0.228 |
| -2.079734336676569 | 7.855 | -7.655 | -0.396 |
| -2.073451151369389 | 7.812 | -7.526 | -0.56 |
| -2.06716796606221 | 7.767 | -7.398 | -0.721 |
| -2.06088478075503 | 7.723 | -7.27 | -0.878 |
| -2.05460159544785 | 7.678 | -7.143 | -1.033 |
| -2.04831841014067 | 7.633 | -7.016 | -1.184 |
| -2.042035224833491 | 7.587 | -6.889 | -1.332 |
| -2.035752039526311 | 7.541 | -6.763 | -1.477 |
| -2.029468854219131 | 7.495 | -6.637 | -1.618 |
| -2.023185668911951 | 7.448 | -6.512 | -1.756 |
| -2.016902483604772 | 7.402 | -6.387 | -1.89 |
| -2.010619298297592 | 7.355 | -6.263 | -2.021 |
| -2.004336112990412 | 7.307 | -6.139 | -2.149 |
| -1.998052927683233 | 7.26 | -6.016 | -2.274 |
| -1.991769742376054 | 7.212 | -5.894 | -2.394 |
| -1.985486557068874 | 7.164 | -5.773 | -2.512 |
| -1.979203371761694 | 7.115 | -5.652 | -2.626 |
| -1.972920186454515 | 7.067 | -5.532 | -2.737 |
| -1.966637001147335 | 7.018 | -5.412 | -2.844 |
| -1.960353815840155 | 6.969 | -5.293 | -2.948 |
| -1.954070630532976 | 6.92 | -5.176 | -3.049 |
| -1.947787445225796 | 6.871 | -5.059 | -3.146 |
| -1.941504259918616 | 6.821 | -4.942 | -3.24 |
| -1.935221074611437 | 6.772 | -4.827 | -3.331 |
| -1.928937889304257 | 6.722 | -4.712 | -3.418 |
| -1.922654703997078 | 6.672 | -4.599 | -3.502 |
| -1.916371518689898 | 6.622 | -4.486 | -3.583 |
| -1.910088333382718 | 6.572 | -4.374 | -3.66 |
| -1.903805148075539 | 6.521 | -4.263 | -3.734 |
| -1.897521962768359 | 6.471 | -4.154 | -3.805 |
| -1.891238777461179 | 6.42 | -4.045 | -3.872 |
| -1.884955592154 | 6.37 | -3.937 | -3.937 |
| -1.87867240684682 | 6.319 | -3.83 | -3.998 |
| -1.87238922153964 | 6.268 | -3.724 | -4.056 |
| -1.866106036232461 | 6.217 | -3.619 | -4.111 |
| -1.859822850925281 | 6.166 | -3.515 | -4.163 |
| -1.853539665618102 | 6.115 | -3.412 | -4.211 |
| -1.847256480310922 | 6.064 | -3.31 | -4.257 |
| -1.840973295003742 | 6.013 | -3.21 | -4.3 |
| -1.834690109696563 | 5.962 | -3.11 | -4.339 |
| -1.828406924389383 | 5.911 | -3.012 | -4.376 |
| -1.822123739082203 | 5.86 | -2.914 | -4.41 |
| -1.815840553775024 | 5.808 | -2.818 | -4.441 |
| -1.809557368467844 | 5.757 | -2.723 | -4.469 |
| -1.803274183160664 | 5.706 | -2.629 | -4.495 |
| -1.796990997853485 | 5.655 | -2.536 | -4.517 |
| -1.790707812546305 | 5.604 | -2.445 | -4.537 |
| -1.784424627239125 | 5.553 | -2.354 | -4.554 |
| -1.778141441931946 | 5.502 | -2.265 | -4.569 |
| -1.771858256624766 | 5.451 | -2.177 | -4.581 |
| -1.765575071317587 | 5.4 | -2.09 | -4.591 |
| -1.759291886010407 | 5.349 | -2.005 | -4.598 |
| -1.753008700703227 | 5.298 | -1.92 | -4.602 |
| -1.746725515396048 | 5.247 | -1.837 | -4.604 |
| -1.740442330088868 | 5.196 | -1.755 | -4.604 |
| -1.734159144781688 | 5.146 | -1.674 | -4.601 |
| -1.727875959474509 | 5.095 | -1.594 | -4.596 |
| -1.72159277416733 | 5.045 | -1.516 | -4.589 |
| -1.715309588860149 | 4.994 | -1.438 | -4.58 |
| -1.70902640355297 | 4.944 | -1.362 | -4.569 |
| -1.70274321824579 | 4.894 | -1.288 | -4.555 |
| -1.69646003293861 | 4.844 | -1.214 | -4.54 |
| -1.690176847631431 | 4.794 | -1.142 | -4.522 |
| -1.683893662324251 | 4.744 | -1.071 | -4.502 |
| -1.677610477017072 | 4.695 | -1.001 | -4.481 |
| -1.671327291709892 | 4.645 | -0.932 | -4.458 |
| -1.665044106402712 | 4.596 | -0.865 | -4.433 |
| -1.658760921095533 | 4.546 | -0.799 | -4.406 |
| -1.652477735788353 | 4.497 | -0.734 | -4.378 |
| -1.646194550481173 | 4.448 | -0.67 | -4.347 |
| -1.639911365173994 | 4.4 | -0.608 | -4.316 |
| -1.633628179866814 | 4.351 | -0.546 | -4.283 |
| -1.627344994559634 | 4.303 | -0.486 | -4.248 |
| -1.621061809252455 | 4.255 | -0.428 | -4.212 |
| -1.614778623945275 | 4.206 | -0.37 | -4.174 |
| -1.608495438638096 | 4.159 | -0.313 | -4.135 |
| -1.602212253330916 | 4.111 | -0.258 | -4.095 |
| -1.595929068023736 | 4.064 | -0.204 | -4.053 |
| -1.589645882716557 | 4.016 | -0.151 | -4.011 |
| -1.583362697409377 | 3.969 | -0.1 | -3.967 |
| -1.577079512102197 | 3.922 | -0.049 | -3.922 |
| -1.570796326795018 | 3.876 | 0 | -3.876 |
| -1.564513141487838 | 3.829 | 0.048 | -3.829 |
| -1.558229956180659 | 3.783 | 0.095 | -3.781 |
| -1.551946770873479 | 3.737 | 0.141 | -3.732 |
| -1.545663585566299 | 3.692 | 0.186 | -3.682 |
| -1.53938040025912 | 3.646 | 0.229 | -3.632 |
| -1.53309721495194 | 3.601 | 0.271 | -3.58 |
| -1.52681402964476 | 3.556 | 0.313 | -3.528 |
| -1.520530844337581 | 3.511 | 0.353 | -3.476 |
| -1.514247659030401 | 3.467 | 0.392 | -3.422 |
| -1.507964473723221 | 3.422 | 0.43 | -3.368 |
| -1.501681288416042 | 3.378 | 0.467 | -3.314 |
| -1.495398103108862 | 3.335 | 0.502 | -3.259 |
| -1.489114917801682 | 3.291 | 0.537 | -3.203 |
| -1.482831732494503 | 3.248 | 0.571 | -3.148 |
| -1.476548547187323 | 3.205 | 0.603 | -3.091 |
| -1.470265361880144 | 3.162 | 0.635 | -3.035 |
| -1.463982176572964 | 3.12 | 0.665 | -2.978 |
| -1.457698991265784 | 3.078 | 0.695 | -2.921 |
| -1.451415805958605 | 3.036 | 0.723 | -2.864 |
| -1.445132620651425 | 2.994 | 0.751 | -2.806 |
| -1.438849435344245 | 2.953 | 0.777 | -2.748 |
| -1.432566250037066 | 2.912 | 0.802 | -2.691 |
| -1.426283064729886 | 2.871 | 0.827 | -2.633 |
| -1.419999879422706 | 2.831 | 0.851 | -2.575 |
| -1.413716694115527 | 2.791 | 0.873 | -2.517 |
| -1.407433508808347 | 2.751 | 0.895 | -2.46 |
| -1.401150323501168 | 2.711 | 0.916 | -2.402 |
| -1.394867138193988 | 2.672 | 0.935 | -2.345 |
| -1.388583952886808 | 2.633 | 0.954 | -2.287 |
| -1.382300767579629 | 2.594 | 0.972 | -2.23 |
| -1.376017582272449 | 2.556 | 0.989 | -2.173 |
| -1.369734396965269 | 2.518 | 1.006 | -2.116 |
| -1.36345121165809 | 2.48 | 1.021 | -2.06 |
| -1.35716802635091 | 2.443 | 1.036 | -2.004 |
| -1.35088484104373 | 2.406 | 1.05 | -1.948 |
| -1.344601655736551 | 2.369 | 1.063 | -1.892 |
| -1.338318470429371 | 2.333 | 1.075 | -1.837 |
| -1.332035285122191 | 2.296 | 1.086 | -1.783 |
| -1.325752099815012 | 2.261 | 1.097 | -1.728 |
| -1.319468914507832 | 2.225 | 1.107 | -1.675 |
| -1.313185729200653 | 2.19 | 1.116 | -1.621 |
| -1.306902543893473 | 2.155 | 1.124 | -1.568 |
| -1.300619358586293 | 2.12 | 1.132 | -1.516 |
| -1.294336173279114 | 2.086 | 1.139 | -1.464 |
| -1.288052987971934 | 2.052 | 1.145 | -1.413 |
| -1.281769802664754 | 2.019 | 1.151 | -1.363 |
| -1.275486617357575 | 1.985 | 1.156 | -1.313 |
| -1.269203432050395 | 1.952 | 1.16 | -1.263 |
| -1.262920246743215 | 1.92 | 1.163 | -1.214 |
| -1.256637061436036 | 1.887 | 1.166 | -1.166 |
| -1.250353876128856 | 1.855 | 1.169 | -1.119 |
| -1.244070690821677 | 1.824 | 1.171 | -1.072 |
| -1.237787505514497 | 1.792 | 1.172 | -1.026 |
| -1.231504320207317 | 1.761 | 1.172 | -0.981 |
| -1.225221134900138 | 1.731 | 1.172 | -0.936 |
| -1.218937949592958 | 1.7 | 1.172 | -0.892 |
| -1.212654764285778 | 1.67 | 1.171 | -0.849 |
| -1.206371578978599 | 1.64 | 1.169 | -0.807 |
| -1.20008839367142 | 1.611 | 1.167 | -0.765 |
| -1.193805208364239 | 1.582 | 1.165 | -0.724 |
| -1.18752202305706 | 1.553 | 1.162 | -0.684 |
| -1.18123883774988 | 1.525 | 1.158 | -0.645 |
| -1.1749556524427 | 1.497 | 1.154 | -0.607 |
| -1.168672467135521 | 1.469 | 1.15 | -0.569 |
| -1.162389281828341 | 1.441 | 1.145 | -0.532 |
| -1.156106096521162 | 1.414 | 1.14 | -0.496 |
| -1.149822911213982 | 1.387 | 1.134 | -0.461 |
| -1.143539725906802 | 1.361 | 1.128 | -0.426 |
| -1.137256540599623 | 1.335 | 1.121 | -0.393 |
| -1.130973355292443 | 1.309 | 1.115 | -0.36 |
| -1.124690169985263 | 1.283 | 1.107 | -0.328 |
| -1.118406984678084 | 1.258 | 1.1 | -0.297 |
| -1.112123799370904 | 1.233 | 1.092 | -0.266 |
| -1.105840614063724 | 1.209 | 1.084 | -0.237 |
| -1.099557428756545 | 1.184 | 1.076 | -0.208 |
| -1.093274243449365 | 1.161 | 1.067 | -0.18 |
| -1.086991058142186 | 1.137 | 1.058 | -0.153 |
| -1.080707872835006 | 1.114 | 1.048 | -0.127 |
| -1.074424687527826 | 1.091 | 1.039 | -0.101 |
| -1.068141502220647 | 1.068 | 1.029 | -0.077 |
| -1.061858316913467 | 1.046 | 1.019 | -0.053 |
| -1.055575131606287 | 1.023 | 1.009 | -0.03 |
| -1.049291946299108 | 1.002 | 0.998 | -0.007 |
| -1.043008760991928 | 0.98 | 0.987 | 0.014 |
| -1.036725575684748 | 0.959 | 0.976 | 0.035 |
| -1.030442390377569 | 0.938 | 0.965 | 0.055 |
| -1.024159205070389 | 0.918 | 0.954 | 0.074 |
| -1.01787601976321 | 0.897 | 0.943 | 0.093 |
| -1.01159283445603 | 0.878 | 0.931 | 0.11 |
| -1.00530964914885 | 0.858 | 0.919 | 0.127 |
| -0.999026463841671 | 0.838 | 0.907 | 0.144 |
| -0.992743278534491 | 0.819 | 0.895 | 0.159 |
| -0.986460093227311 | 0.801 | 0.883 | 0.174 |
| -0.980176907920132 | 0.782 | 0.871 | 0.188 |
| -0.973893722612952 | 0.764 | 0.859 | 0.202 |
| -0.967610537305772 | 0.746 | 0.846 | 0.214 |
| -0.961327351998593 | 0.728 | 0.834 | 0.226 |
| -0.955044166691413 | 0.711 | 0.821 | 0.238 |
| -0.948760981384233 | 0.694 | 0.809 | 0.249 |
| -0.942477796077054 | 0.677 | 0.796 | 0.259 |
| -0.936194610769874 | 0.661 | 0.784 | 0.268 |
| -0.929911425462695 | 0.645 | 0.771 | 0.277 |
| -0.923628240155515 | 0.629 | 0.758 | 0.285 |
| -0.917345054848335 | 0.613 | 0.745 | 0.293 |
| -0.911061869541156 | 0.598 | 0.732 | 0.3 |
| -0.904778684233976 | 0.582 | 0.72 | 0.307 |
| -0.898495498926796 | 0.568 | 0.707 | 0.313 |
| -0.892212313619617 | 0.553 | 0.694 | 0.318 |
| -0.885929128312437 | 0.539 | 0.681 | 0.323 |
| -0.879645943005257 | 0.524 | 0.669 | 0.328 |
| -0.873362757698078 | 0.511 | 0.656 | 0.332 |
| -0.867079572390898 | 0.497 | 0.643 | 0.335 |
| -0.860796387083718 | 0.484 | 0.631 | 0.338 |
| -0.854513201776539 | 0.471 | 0.618 | 0.341 |
| -0.848230016469359 | 0.458 | 0.605 | 0.343 |
| -0.84194683116218 | 0.445 | 0.593 | 0.345 |
| -0.835663645855 | 0.433 | 0.581 | 0.346 |
| -0.82938046054782 | 0.421 | 0.568 | 0.347 |
| -0.823097275240641 | 0.409 | 0.556 | 0.347 |
| -0.816814089933461 | 0.397 | 0.544 | 0.347 |
| -0.810530904626281 | 0.386 | 0.532 | 0.347 |
| -0.804247719319102 | 0.375 | 0.52 | 0.346 |
| -0.797964534011922 | 0.364 | 0.508 | 0.345 |
| -0.791681348704742 | 0.353 | 0.496 | 0.344 |
| -0.785398163397563 | 0.343 | 0.484 | 0.343 |
| -0.779114978090383 | 0.332 | 0.473 | 0.341 |
| -0.772831792783204 | 0.322 | 0.461 | 0.338 |
| -0.766548607476024 | 0.312 | 0.45 | 0.336 |
| -0.760265422168844 | 0.303 | 0.439 | 0.333 |
| -0.753982236861665 | 0.293 | 0.428 | 0.33 |
| -0.747699051554485 | 0.284 | 0.417 | 0.327 |
| -0.741415866247305 | 0.275 | 0.406 | 0.324 |
| -0.735132680940126 | 0.266 | 0.395 | 0.32 |
| -0.728849495632946 | 0.258 | 0.385 | 0.316 |
| -0.722566310325766 | 0.249 | 0.374 | 0.312 |
| -0.716283125018587 | 0.241 | 0.364 | 0.308 |
| -0.709999939711407 | 0.233 | 0.354 | 0.303 |
| -0.703716754404227 | 0.225 | 0.344 | 0.299 |
| -0.697433569097048 | 0.218 | 0.334 | 0.294 |
| -0.691150383789868 | 0.21 | 0.324 | 0.289 |
| -0.684867198482689 | 0.203 | 0.315 | 0.284 |
| -0.678584013175509 | 0.196 | 0.305 | 0.279 |
| -0.672300827868329 | 0.189 | 0.296 | 0.274 |
| -0.66601764256115 | 0.183 | 0.287 | 0.269 |
| -0.65973445725397 | 0.176 | 0.278 | 0.264 |
| -0.65345127194679 | 0.17 | 0.269 | 0.258 |
| -0.647168086639611 | 0.163 | 0.261 | 0.253 |
| -0.640884901332431 | 0.157 | 0.252 | 0.247 |
| -0.634601716025251 | 0.152 | 0.244 | 0.242 |
| -0.628318530718072 | 0.146 | 0.236 | 0.236 |
| -0.622035345410892 | 0.14 | 0.228 | 0.23 |
| -0.615752160103712 | 0.135 | 0.22 | 0.225 |
| -0.609468974796533 | 0.13 | 0.213 | 0.219 |
| -0.603185789489353 | 0.124 | 0.205 | 0.213 |
| -0.596902604182174 | 0.12 | 0.198 | 0.208 |
| -0.590619418874994 | 0.115 | 0.191 | 0.202 |
| -0.584336233567814 | 0.11 | 0.184 | 0.196 |
| -0.578053048260635 | 0.106 | 0.177 | 0.191 |
| -0.571769862953455 | 0.101 | 0.17 | 0.185 |
| -0.565486677646275 | 0.097 | 0.164 | 0.179 |
| -0.559203492339096 | 0.093 | 0.157 | 0.174 |
| -0.552920307031916 | 0.089 | 0.151 | 0.168 |
| -0.546637121724737 | 0.085 | 0.145 | 0.163 |
| -0.540353936417557 | 0.081 | 0.139 | 0.158 |
| -0.534070751110377 | 0.078 | 0.133 | 0.152 |
| -0.527787565803198 | 0.074 | 0.128 | 0.147 |
| -0.521504380496018 | 0.071 | 0.123 | 0.142 |
| -0.515221195188838 | 0.067 | 0.117 | 0.137 |
| -0.508938009881659 | 0.064 | 0.112 | 0.132 |
| -0.502654824574479 | 0.061 | 0.107 | 0.127 |
| -0.496371639267299 | 0.058 | 0.102 | 0.122 |
| -0.49008845396012 | 0.055 | 0.098 | 0.117 |
| -0.48380526865294 | 0.053 | 0.093 | 0.112 |
| -0.477522083345761 | 0.05 | 0.089 | 0.108 |
| -0.471238898038581 | 0.048 | 0.085 | 0.103 |
| -0.464955712731402 | 0.045 | 0.081 | 0.099 |
| -0.458672527424222 | 0.043 | 0.077 | 0.095 |
| -0.452389342117042 | 0.04 | 0.073 | 0.09 |
| -0.446106156809863 | 0.038 | 0.069 | 0.086 |
| -0.439822971502683 | 0.036 | 0.066 | 0.082 |
| -0.433539786195504 | 0.034 | 0.062 | 0.079 |
| -0.427256600888324 | 0.032 | 0.059 | 0.075 |
| -0.420973415581144 | 0.03 | 0.056 | 0.071 |
| -0.414690230273965 | 0.029 | 0.053 | 0.068 |
| -0.408407044966785 | 0.027 | 0.05 | 0.064 |
| -0.402123859659606 | 0.025 | 0.047 | 0.061 |
| -0.395840674352426 | 0.024 | 0.044 | 0.058 |
| -0.389557489045247 | 0.022 | 0.042 | 0.054 |
| -0.383274303738067 | 0.021 | 0.039 | 0.051 |
| -0.376991118430887 | 0.02 | 0.037 | 0.048 |
| -0.370707933123708 | 0.018 | 0.034 | 0.046 |
| -0.364424747816528 | 0.017 | 0.032 | 0.043 |
| -0.358141562509349 | 0.016 | 0.03 | 0.04 |
| -0.351858377202169 | 0.015 | 0.028 | 0.038 |
| -0.345575191894989 | 0.014 | 0.026 | 0.036 |
| -0.33929200658781 | 0.013 | 0.025 | 0.033 |
| -0.33300882128063 | 0.012 | 0.023 | 0.031 |
| -0.326725635973451 | 0.011 | 0.021 | 0.029 |
| -0.320442450666271 | 0.01 | 0.02 | 0.027 |
| -0.314159265359092 | 0.01 | 0.018 | 0.025 |
| -0.307876080051912 | 0.009 | 0.017 | 0.023 |
| -0.301592894744732 | 0.008 | 0.016 | 0.022 |
| -0.295309709437553 | 0.007 | 0.014 | 0.02 |
| -0.289026524130373 | 0.007 | 0.013 | 0.018 |
| -0.282743338823194 | 0.006 | 0.012 | 0.017 |
| -0.276460153516014 | 0.006 | 0.011 | 0.016 |
| -0.270176968208834 | 0.005 | 0.01 | 0.014 |
| -0.263893782901655 | 0.005 | 0.009 | 0.013 |
| -0.257610597594475 | 0.004 | 0.008 | 0.012 |
| -0.251327412287296 | 0.004 | 0.008 | 0.011 |
| -0.245044226980116 | 0.004 | 0.007 | 0.01 |
| -0.238761041672937 | 0.003 | 0.006 | 0.009 |
| -0.232477856365757 | 0.003 | 0.006 | 0.008 |
| -0.226194671058577 | 0.003 | 0.005 | 0.007 |
| -0.219911485751398 | 0.002 | 0.005 | 0.007 |
| -0.213628300444218 | 0.002 | 0.004 | 0.006 |
| -0.207345115137039 | 0.002 | 0.004 | 0.005 |
| -0.201061929829859 | 0.002 | 0.003 | 0.005 |
| -0.194778744522679 | 0.001 | 0.003 | 0.004 |
| -0.1884955592155 | 0.001 | 0.002 | 0.004 |
| -0.18221237390832 | 0.001 | 0.002 | 0.003 |
| -0.175929188601141 | 0.001 | 0.002 | 0.003 |
| -0.169646003293961 | 0.001 | 0.002 | 0.002 |
| -0.163362817986782 | 0.001 | 0.001 | 0.002 |
| -0.157079632679602 | 0.001 | 0.001 | 0.002 |
| -0.150796447372422 | 0.001 | 0.001 | 0.001 |
| -0.144513262065243 | 0 | 0.001 | 0.001 |
| -0.138230076758063 | 0 | 0.001 | 0.001 |
| -0.131946891450884 | 0 | 0.001 | 0.001 |
| -0.125663706143704 | 0 | 0 | 0.001 |
| -0.119380520836524 | 0 | 0 | 0.001 |
| -0.113097335529345 | 0 | 0 | 0 |
| -0.106814150222165 | 0 | 0 | 0 |
| -0.100530964914986 | 0 | 0 | 0 |
| -0.0942477796078061 | 0 | 0 | 0 |
| -0.0879645943006265 | 0 | 0 | 0 |
| -0.0816814089934469 | 0 | 0 | 0 |
| -0.0753982236862674 | 0 | 0 | 0 |
| -0.0691150383790878 | 0 | 0 | 0 |
| -0.0628318530719082 | 0 | 0 | 0 |
| -0.0565486677647286 | 0 | 0 | 0 |
| -0.050265482457549 | 0 | 0 | 0 |
| -0.0439822971503694 | 0 | 0 | 0 |
| -0.0376991118431899 | 0 | 0 | 0 |
| -0.0314159265360103 | 0 | 0 | 0 |
| -0.0251327412288307 | 0 | 0 | 0 |
| -0.0188495559216511 | 0 | 0 | 0 |
| -0.0125663706144715 | 0 | 0 | 0 |
| -0.00628318530729192 | 0 | 0 | 0 |
| -1.12338957580782e-13 | 0 | 0 | 0 |
| 0.00628318530706725 | 0 | 0 | 0 |
| 0.0125663706142468 | 0 | 0 | 0 |
| 0.0188495559214264 | 0 | 0 | 0 |
| 0.025132741228606 | 0 | 0 | 0 |
| 0.0314159265357856 | 0 | 0 | 0 |
| 0.0376991118429652 | 0 | 0 | 0 |
| 0.0439822971501448 | 0 | 0 | 0 |
| 0.0502654824573243 | 0 | 0 | 0 |
| 0.0565486677645039 | 0 | 0 | 0 |
| 0.0628318530716835 | 0 | 0 | 0 |
| 0.0691150383788631 | 0 | 0 | 0 |
| 0.0753982236860427 | 0 | 0 | 0 |
| 0.0816814089932222 | 0 | 0 | 0 |
| 0.0879645943004018 | 0 | 0 | 0 |
| 0.0942477796075814 | 0 | 0 | 0 |
| 0.100530964914761 | 0 | 0 | 0 |
| 0.106814150221941 | 0 | 0 | 0 |
| 0.11309733552912 | 0 | 0 | 0 |
| 0.1193805208363 | 0 | 0 | 0.001 |
| 0.125663706143479 | 0 | 0 | 0.001 |
| 0.131946891450659 | 0 | 0.001 | 0.001 |
| 0.138230076757839 | 0 | 0.001 | 0.001 |
| 0.144513262065018 | 0 | 0.001 | 0.001 |
| 0.150796447372198 | 0.001 | 0.001 | 0.001 |
| 0.157079632679377 | 0.001 | 0.001 | 0.002 |
| 0.163362817986557 | 0.001 | 0.001 | 0.002 |
| 0.169646003293736 | 0.001 | 0.002 | 0.002 |
| 0.175929188600916 | 0.001 | 0.002 | 0.003 |
| 0.182212373908096 | 0.001 | 0.002 | 0.003 |
| 0.188495559215275 | 0.001 | 0.002 | 0.004 |
| 0.194778744522455 | 0.001 | 0.003 | 0.004 |
| 0.201061929829634 | 0.002 | 0.003 | 0.005 |
| 0.207345115136814 | 0.002 | 0.004 | 0.005 |
| 0.213628300443994 | 0.002 | 0.004 | 0.006 |
| 0.219911485751173 | 0.002 | 0.005 | 0.007 |
| 0.226194671058353 | 0.003 | 0.005 | 0.007 |
| 0.232477856365532 | 0.003 | 0.006 | 0.008 |
| 0.238761041672712 | 0.003 | 0.006 | 0.009 |
| 0.245044226979891 | 0.004 | 0.007 | 0.01 |
| 0.251327412287071 | 0.004 | 0.008 | 0.011 |
| 0.257610597594251 | 0.004 | 0.008 | 0.012 |
| 0.26389378290143 | 0.005 | 0.009 | 0.013 |
| 0.27017696820861 | 0.005 | 0.01 | 0.014 |
| 0.276460153515789 | 0.006 | 0.011 | 0.016 |
| 0.282743338822969 | 0.006 | 0.012 | 0.017 |
| 0.289026524130149 | 0.007 | 0.013 | 0.018 |
| 0.295309709437328 | 0.007 | 0.014 | 0.02 |
| 0.301592894744508 | 0.008 | 0.016 | 0.022 |
| 0.307876080051687 | 0.009 | 0.017 | 0.023 |
| 0.314159265358867 | 0.01 | 0.018 | 0.025 |
| 0.320442450666046 | 0.01 | 0.02 | 0.027 |
| 0.326725635973226 | 0.011 | 0.021 | 0.029 |
| 0.333008821280406 | 0.012 | 0.023 | 0.031 |
| 0.339292006587585 | 0.013 | 0.025 | 0.033 |
| 0.345575191894765 | 0.014 | 0.026 | 0.036 |
| 0.351858377201944 | 0.015 | 0.028 | 0.038 |
| 0.358141562509124 | 0.016 | 0.03 | 0.04 |
| 0.364424747816304 | 0.017 | 0.032 | 0.043 |
| 0.370707933123483 | 0.018 | 0.034 | 0.046 |
| 0.376991118430663 | 0.02 | 0.037 | 0.048 |
| 0.383274303737842 | 0.021 | 0.039 | 0.051 |
| 0.389557489045022 | 0.022 | 0.042 | 0.054 |
| 0.395840674352201 | 0.024 | 0.044 | 0.058 |
| 0.402123859659381 | 0.025 | 0.047 | 0.061 |
| 0.408407044966561 | 0.027 | 0.05 | 0.064 |
| 0.41469023027374 | 0.029 | 0.053 | 0.068 |
| 0.42097341558092 | 0.03 | 0.056 | 0.071 |
| 0.427256600888099 | 0.032 | 0.059 | 0.075 |
| 0.433539786195279 | 0.034 | 0.062 | 0.079 |
| 0.439822971502459 | 0.036 | 0.066 | 0.082 |
| 0.446106156809638 | 0.038 | 0.069 | 0.086 |
| 0.452389342116818 | 0.04 | 0.073 | 0.09 |
| 0.458672527423997 | 0.043 | 0.077 | 0.095 |
| 0.464955712731177 | 0.045 | 0.081 | 0.099 |
| 0.471238898038356 | 0.048 | 0.085 | 0.103 |
| 0.477522083345536 | 0.05 | 0.089 | 0.108 |
| 0.483805268652716 | 0.053 | 0.093 | 0.112 |
| 0.490088453959895 | 0.055 | 0.098 | 0.117 |
| 0.496371639267075 | 0.058 | 0.102 | 0.122 |
| 0.502654824574254 | 0.061 | 0.107 | 0.127 |
| 0.508938009881434 | 0.064 | 0.112 | 0.132 |
| 0.515221195188614 | 0.067 | 0.117 | 0.137 |
| 0.521504380495793 | 0.071 | 0.123 | 0.142 |
| 0.527787565802973 | 0.074 | 0.128 | 0.147 |
| 0.534070751110153 | 0.078 | 0.133 | 0.152 |
| 0.540353936417332 | 0.081 | 0.139 | 0.158 |
| 0.546637121724512 | 0.085 | 0.145 | 0.163 |
| 0.552920307031692 | 0.089 | 0.151 | 0.168 |
| 0.559203492338871 | 0.093 | 0.157 | 0.174 |
| 0.565486677646051 | 0.097 | 0.164 | 0.179 |
| 0.571769862953231 | 0.101 | 0.17 | 0.185 |
| 0.57805304826041 | 0.106 | 0.177 | 0.191 |
| 0.58433623356759 | 0.11 | 0.184 | 0.196 |
| 0.590619418874769 | 0.115 | 0.191 | 0.202 |
| 0.596902604181949 | 0.12 | 0.198 | 0.208 |
| 0.603185789489129 | 0.124 | 0.205 | 0.213 |
| 0.609468974796308 | 0.13 | 0.213 | 0.219 |
| 0.615752160103488 | 0.135 | 0.22 | 0.225 |
| 0.622035345410668 | 0.14 | 0.228 | 0.23 |
| 0.628318530717847 | 0.146 | 0.236 | 0.236 |
| 0.634601716025027 | 0.152 | 0.244 | 0.242 |
| 0.640884901332206 | 0.157 | 0.252 | 0.247 |
| 0.647168086639386 | 0.163 | 0.261 | 0.253 |
| 0.653451271946566 | 0.17 | 0.269 | 0.258 |
| 0.659734457253745 | 0.176 | 0.278 | 0.264 |
| 0.666017642560925 | 0.183 | 0.287 | 0.269 |
| 0.672300827868105 | 0.189 | 0.296 | 0.274 |
| 0.678584013175284 | 0.196 | 0.305 | 0.279 |
| 0.684867198482464 | 0.203 | 0.315 | 0.284 |
| 0.691150383789644 | 0.21 | 0.324 | 0.289 |
| 0.697433569096823 | 0.218 | 0.334 | 0.294 |
| 0.703716754404003 | 0.225 | 0.344 | 0.299 |
| 0.709999939711183 | 0.233 | 0.354 | 0.303 |
| 0.716283125018362 | 0.241 | 0.364 | 0.308 |
| 0.722566310325542 | 0.249 | 0.374 | 0.312 |
| 0.728849495632721 | 0.258 | 0.385 | 0.316 |
| 0.735132680939901 | 0.266 | 0.395 | 0.32 |
| 0.741415866247081 | 0.275 | 0.406 | 0.324 |
| 0.74769905155426 | 0.284 | 0.417 | 0.327 |
| 0.75398223686144 | 0.293 | 0.428 | 0.33 |
| 0.76026542216862 | 0.303 | 0.439 | 0.333 |
| 0.766548607475799 | 0.312 | 0.45 | 0.336 |
| 0.772831792782979 | 0.322 | 0.461 | 0.338 |
| 0.779114978090159 | 0.332 | 0.473 | 0.341 |
| 0.785398163397338 | 0.343 | 0.484 | 0.343 |
| 0.791681348704518 | 0.353 | 0.496 | 0.344 |
| 0.797964534011697 | 0.364 | 0.508 | 0.345 |
| 0.804247719318877 | 0.375 | 0.52 | 0.346 |
| 0.810530904626057 | 0.386 | 0.532 | 0.347 |
| 0.816814089933236 | 0.397 | 0.544 | 0.347 |
| 0.823097275240416 | 0.409 | 0.556 | 0.347 |
| 0.829380460547596 | 0.421 | 0.568 | 0.347 |
| 0.835663645854775 | 0.433 | 0.581 | 0.346 |
| 0.841946831161955 | 0.445 | 0.593 | 0.345 |
| 0.848230016469135 | 0.458 | 0.605 | 0.343 |
| 0.854513201776314 | 0.471 | 0.618 | 0.341 |
| 0.860796387083494 | 0.484 | 0.631 | 0.338 |
| 0.867079572390674 | 0.497 | 0.643 | 0.335 |
| 0.873362757697853 | 0.511 | 0.656 | 0.332 |
| 0.879645943005033 | 0.524 | 0.669 | 0.328 |
| 0.885929128312212 | 0.539 | 0.681 | 0.323 |
| 0.892212313619392 | 0.553 | 0.694 | 0.318 |
| 0.898495498926572 | 0.568 | 0.707 | 0.313 |
| 0.904778684233751 | 0.582 | 0.72 | 0.307 |
| 0.911061869540931 | 0.598 | 0.732 | 0.3 |
| 0.917345054848111 | 0.613 | 0.745 | 0.293 |
| 0.92362824015529 | 0.629 | 0.758 | 0.285 |
| 0.92991142546247 | 0.645 | 0.771 | 0.277 |
| 0.93619461076965 | 0.661 | 0.784 | 0.268 |
| 0.942477796076829 | 0.677 | 0.796 | 0.259 |
| 0.948760981384009 | 0.694 | 0.809 | 0.249 |
| 0.955044166691188 | 0.711 | 0.821 | 0.238 |
| 0.961327351998368 | 0.728 | 0.834 | 0.226 |
| 0.967610537305548 | 0.746 | 0.846 | 0.214 |
| 0.973893722612727 | 0.764 | 0.859 | 0.202 |
| 0.980176907919907 | 0.782 | 0.871 | 0.188 |
| 0.986460093227087 | 0.801 | 0.883 | 0.174 |
| 0.992743278534266 | 0.819 | 0.895 | 0.159 |
| 0.999026463841446 | 0.838 | 0.907 | 0.144 |
| 1.005309649148626 | 0.858 | 0.919 | 0.127 |
| 1.011592834455805 | 0.878 | 0.931 | 0.11 |
| 1.017876019762985 | 0.897 | 0.943 | 0.093 |
| 1.024159205070164 | 0.918 | 0.954 | 0.074 |
| 1.030442390377344 | 0.938 | 0.965 | 0.055 |
| 1.036725575684524 | 0.959 | 0.976 | 0.035 |
| 1.043008760991703 | 0.98 | 0.987 | 0.014 |
| 1.049291946298883 | 1.002 | 0.998 | -0.007 |
| 1.055575131606063 | 1.023 | 1.009 | -0.03 |
| 1.061858316913242 | 1.046 | 1.019 | -0.053 |
| 1.068141502220422 | 1.068 | 1.029 | -0.077 |
| 1.074424687527602 | 1.091 | 1.039 | -0.101 |
| 1.080707872834781 | 1.114 | 1.048 | -0.127 |
| 1.086991058141961 | 1.137 | 1.058 | -0.153 |
| 1.09327424344914 | 1.161 | 1.067 | -0.18 |
| 1.09955742875632 | 1.184 | 1.076 | -0.208 |
| 1.1058406140635 | 1.209 | 1.084 | -0.237 |
| 1.112123799370679 | 1.233 | 1.092 | -0.266 |
| 1.11840698467786 | 1.258 | 1.1 | -0.297 |
| 1.124690169985039 | 1.283 | 1.107 | -0.328 |
| 1.130973355292218 | 1.309 | 1.115 | -0.36 |
| 1.137256540599398 | 1.335 | 1.121 | -0.393 |
| 1.143539725906578 | 1.361 | 1.128 | -0.426 |
| 1.149822911213757 | 1.387 | 1.134 | -0.461 |
| 1.156106096520937 | 1.414 | 1.14 | -0.496 |
| 1.162389281828116 | 1.441 | 1.145 | -0.532 |
| 1.168672467135296 | 1.469 | 1.15 | -0.569 |
| 1.174955652442476 | 1.497 | 1.154 | -0.607 |
| 1.181238837749655 | 1.525 | 1.158 | -0.645 |
| 1.187522023056835 | 1.553 | 1.162 | -0.684 |
| 1.193805208364015 | 1.582 | 1.165 | -0.724 |
| 1.200088393671194 | 1.611 | 1.167 | -0.765 |
| 1.206371578978374 | 1.64 | 1.169 | -0.807 |
| 1.212654764285554 | 1.67 | 1.171 | -0.849 |
| 1.218937949592733 | 1.7 | 1.172 | -0.892 |
| 1.225221134899913 | 1.731 | 1.172 | -0.936 |
| 1.231504320207093 | 1.761 | 1.172 | -0.981 |
| 1.237787505514272 | 1.792 | 1.172 | -1.026 |
| 1.244070690821452 | 1.824 | 1.171 | -1.072 |
| 1.250353876128631 | 1.855 | 1.169 | -1.119 |
| 1.256637061435811 | 1.887 | 1.166 | -1.166 |
| 1.262920246742991 | 1.92 | 1.163 | -1.214 |
| 1.26920343205017 | 1.952 | 1.16 | -1.263 |
| 1.27548661735735 | 1.985 | 1.156 | -1.313 |
| 1.28176980266453 | 2.019 | 1.151 | -1.363 |
| 1.28805298797171 | 2.052 | 1.145 | -1.413 |
| 1.294336173278889 | 2.086 | 1.139 | -1.464 |
| 1.300619358586069 | 2.12 | 1.132 | -1.516 |
| 1.306902543893248 | 2.155 | 1.124 | -1.568 |
| 1.313185729200428 | 2.19 | 1.116 | -1.621 |
| 1.319468914507607 | 2.225 | 1.107 | -1.675 |
| 1.325752099814787 | 2.261 | 1.097 | -1.728 |
| 1.332035285121967 | 2.296 | 1.086 | -1.783 |
| 1.338318470429146 | 2.333 | 1.075 | -1.837 |
| 1.344601655736326 | 2.369 | 1.063 | -1.892 |
| 1.350884841043506 | 2.406 | 1.05 | -1.948 |
| 1.357168026350685 | 2.443 | 1.036 | -2.004 |
| 1.363451211657865 | 2.48 | 1.021 | -2.06 |
| 1.369734396965045 | 2.518 | 1.006 | -2.116 |
| 1.376017582272224 | 2.556 | 0.989 | -2.173 |
| 1.382300767579404 | 2.594 | 0.972 | -2.23 |
| 1.388583952886583 | 2.633 | 0.954 | -2.287 |
| 1.394867138193763 | 2.672 | 0.935 | -2.345 |
| 1.401150323500943 | 2.711 | 0.916 | -2.402 |
| 1.407433508808122 | 2.751 | 0.895 | -2.46 |
| 1.413716694115302 | 2.791 | 0.873 | -2.517 |
| 1.419999879422482 | 2.831 | 0.851 | -2.575 |
| 1.426283064729661 | 2.871 | 0.827 | -2.633 |
| 1.432566250036841 | 2.912 | 0.802 | -2.691 |
| 1.438849435344021 | 2.953 | 0.777 | -2.748 |
| 1.4451326206512 | 2.994 | 0.751 | -2.806 |
| 1.45141580595838 | 3.036 | 0.723 | -2.864 |
| 1.45769899126556 | 3.078 | 0.695 | -2.921 |
| 1.46398217657274 | 3.12 | 0.665 | -2.978 |
| 1.470265361879919 | 3.162 | 0.635 | -3.035 |
| 1.476548547187098 | 3.205 | 0.603 | -3.091 |
| 1.482831732494278 | 3.248 | 0.571 | -3.148 |
| 1.489114917801458 | 3.291 | 0.537 | -3.203 |
| 1.495398103108637 | 3.335 | 0.502 | -3.259 |
| 1.501681288415817 | 3.378 | 0.467 | -3.314 |
| 1.507964473722997 | 3.422 | 0.43 | -3.368 |
| 1.514247659030176 | 3.467 | 0.392 | -3.422 |
| 1.520530844337356 | 3.511 | 0.353 | -3.476 |
| 1.526814029644536 | 3.556 | 0.313 | -3.528 |
| 1.533097214951715 | 3.601 | 0.271 | -3.58 |
| 1.539380400258895 | 3.646 | 0.229 | -3.632 |
| 1.545663585566075 | 3.692 | 0.186 | -3.682 |
| 1.551946770873254 | 3.737 | 0.141 | -3.732 |
| 1.558229956180434 | 3.783 | 0.095 | -3.781 |
| 1.564513141487613 | 3.829 | 0.048 | -3.829 |
| 1.570796326794793 | 3.876 | 0 | -3.876 |
| 1.577079512101973 | 3.922 | -0.049 | -3.922 |
| 1.583362697409152 | 3.969 | -0.1 | -3.967 |
| 1.589645882716332 | 4.016 | -0.151 | -4.011 |
| 1.595929068023512 | 4.064 | -0.204 | -4.053 |
| 1.602212253330691 | 4.111 | -0.258 | -4.095 |
| 1.608495438637871 | 4.159 | -0.313 | -4.135 |
| 1.61477862394505 | 4.206 | -0.37 | -4.174 |
| 1.62106180925223 | 4.255 | -0.428 | -4.212 |
| 1.62734499455941 | 4.303 | -0.486 | -4.248 |
| 1.633628179866589 | 4.351 | -0.546 | -4.283 |
| 1.63991136517377 | 4.4 | -0.608 | -4.316 |
| 1.646194550480949 | 4.448 | -0.67 | -4.347 |
| 1.652477735788128 | 4.497 | -0.734 | -4.378 |
| 1.658760921095308 | 4.546 | -0.799 | -4.406 |
| 1.665044106402488 | 4.596 | -0.865 | -4.433 |
| 1.671327291709667 | 4.645 | -0.932 | -4.458 |
| 1.677610477016847 | 4.695 | -1.001 | -4.481 |
| 1.683893662324026 | 4.744 | -1.071 | -4.502 |
| 1.690176847631206 | 4.794 | -1.142 | -4.522 |
| 1.696460032938386 | 4.844 | -1.214 | -4.54 |
| 1.702743218245565 | 4.894 | -1.288 | -4.555 |
| 1.709026403552745 | 4.944 | -1.362 | -4.569 |
| 1.715309588859925 | 4.994 | -1.438 | -4.58 |
| 1.721592774167104 | 5.045 | -1.516 | -4.589 |
| 1.727875959474284 | 5.095 | -1.594 | -4.596 |
| 1.734159144781464 | 5.146 | -1.674 | -4.601 |
| 1.740442330088643 | 5.196 | -1.755 | -4.604 |
| 1.746725515395823 | 5.247 | -1.837 | -4.604 |
| 1.753008700703003 | 5.298 | -1.92 | -4.602 |
| 1.759291886010182 | 5.349 | -2.005 | -4.598 |
| 1.765575071317362 | 5.4 | -2.09 | -4.591 |
| 1.771858256624541 | 5.451 | -2.177 | -4.581 |
| 1.778141441931721 | 5.502 | -2.265 | -4.569 |
| 1.784424627238901 | 5.553 | -2.354 | -4.554 |
| 1.79070781254608 | 5.604 | -2.445 | -4.537 |
| 1.79699099785326 | 5.655 | -2.536 | -4.517 |
| 1.80327418316044 | 5.706 | -2.629 | -4.495 |
| 1.809557368467619 | 5.757 | -2.723 | -4.469 |
| 1.815840553774799 | 5.808 | -2.818 | -4.441 |
| 1.822123739081979 | 5.86 | -2.914 | -4.41 |
| 1.828406924389158 | 5.911 | -3.012 | -4.376 |
| 1.834690109696338 | 5.962 | -3.11 | -4.339 |
| 1.840973295003518 | 6.013 | -3.21 | -4.3 |
| 1.847256480310697 | 6.064 | -3.31 | -4.257 |
| 1.853539665617877 | 6.115 | -3.412 | -4.211 |
| 1.859822850925056 | 6.166 | -3.515 | -4.163 |
| 1.866106036232236 | 6.217 | -3.619 | -4.111 |
| 1.872389221539416 | 6.268 | -3.724 | -4.056 |
| 1.878672406846595 | 6.319 | -3.83 | -3.998 |
| 1.884955592153775 | 6.37 | -3.937 | -3.937 |
| 1.891238777460955 | 6.42 | -4.045 | -3.872 |
| 1.897521962768134 | 6.471 | -4.154 | -3.805 |
| 1.903805148075314 | 6.521 | -4.263 | -3.734 |
| 1.910088333382494 | 6.572 | -4.374 | -3.66 |
| 1.916371518689673 | 6.622 | -4.486 | -3.583 |
| 1.922654703996853 | 6.672 | -4.599 | -3.502 |
| 1.928937889304033 | 6.722 | -4.712 | -3.418 |
| 1.935221074611212 | 6.772 | -4.827 | -3.331 |
| 1.941504259918392 | 6.821 | -4.942 | -3.24 |
| 1.947787445225571 | 6.871 | -5.059 | -3.146 |
| 1.954070630532751 | 6.92 | -5.176 | -3.049 |
| 1.960353815839931 | 6.969 | -5.293 | -2.948 |
| 1.96663700114711 | 7.018 | -5.412 | -2.844 |
| 1.97292018645429 | 7.067 | -5.532 | -2.737 |
| 1.97920337176147 | 7.115 | -5.652 | -2.626 |
| 1.985486557068649 | 7.164 | -5.773 | -2.512 |
| 1.991769742375829 | 7.212 | -5.894 | -2.394 |
| 1.998052927683009 | 7.26 | -6.016 | -2.274 |
| 2.004336112990188 | 7.307 | -6.139 | -2.149 |
| 2.010619298297368 | 7.355 | -6.263 | -2.021 |
| 2.016902483604547 | 7.402 | -6.387 | -1.89 |
| 2.023185668911727 | 7.448 | -6.512 | -1.756 |
| 2.029468854218907 | 7.495 | -6.637 | -1.618 |
| 2.035752039526086 | 7.541 | -6.763 | -1.477 |
| 2.042035224833266 | 7.587 | -6.889 | -1.332 |
| 2.048318410140446 | 7.633 | -7.016 | -1.184 |
| 2.054601595447625 | 7.678 | -7.143 | -1.033 |
| 2.060884780754805 | 7.723 | -7.27 | -0.878 |
| 2.067167966061984 | 7.767 | -7.398 | -0.721 |
| 2.073451151369164 | 7.812 | -7.526 | -0.56 |
| 2.079734336676344 | 7.855 | -7.655 | -0.396 |
| 2.086017521983524 | 7.899 | -7.784 | -0.228 |
| 2.092300707290703 | 7.942 | -7.913 | -0.058 |
| 2.098583892597883 | 7.985 | -8.042 | 0.116 |
| 2.104867077905062 | 8.027 | -8.172 | 0.293 |
| 2.111150263212242 | 8.069 | -8.302 | 0.473 |
| 2.117433448519422 | 8.11 | -8.432 | 0.656 |
| 2.123716633826601 | 8.151 | -8.562 | 0.841 |
| 2.129999819133781 | 8.192 | -8.691 | 1.03 |
| 2.136283004440961 | 8.232 | -8.821 | 1.222 |
| 2.14256618974814 | 8.271 | -8.951 | 1.416 |
| 2.14884937505532 | 8.31 | -9.081 | 1.614 |
| 2.1551325603625 | 8.349 | -9.211 | 1.814 |
| 2.16141574566968 | 8.387 | -9.341 | 2.017 |
| 2.167698930976859 | 8.425 | -9.471 | 2.222 |
| 2.173982116284038 | 8.462 | -9.6 | 2.43 |
| 2.180265301591218 | 8.498 | -9.729 | 2.64 |
| 2.186548486898398 | 8.534 | -9.858 | 2.853 |
| 2.192831672205577 | 8.569 | -9.986 | 3.069 |
| 2.199114857512757 | 8.604 | -10.115 | 3.286 |
| 2.205398042819936 | 8.638 | -10.242 | 3.506 |
| 2.211681228127116 | 8.672 | -10.37 | 3.729 |
| 2.217964413434296 | 8.705 | -10.497 | 3.953 |
| 2.224247598741475 | 8.737 | -10.623 | 4.179 |
| 2.230530784048655 | 8.769 | -10.749 | 4.407 |
| 2.236813969355835 | 8.8 | -10.874 | 4.637 |
| 2.243097154663014 | 8.83 | -10.999 | 4.869 |
| 2.249380339970194 | 8.86 | -11.123 | 5.103 |
| 2.255663525277374 | 8.889 | -11.246 | 5.338 |
| 2.261946710584553 | 8.917 | -11.368 | 5.575 |
| 2.268229895891733 | 8.945 | -11.49 | 5.814 |
| 2.274513081198912 | 8.972 | -11.61 | 6.053 |
| 2.280796266506092 | 8.998 | -11.73 | 6.294 |
| 2.287079451813272 | 9.023 | -11.849 | 6.537 |
| 2.293362637120452 | 9.048 | -11.967 | 6.78 |
| 2.299645822427631 | 9.072 | -12.084 | 7.024 |
| 2.305929007734811 | 9.095 | -12.199 | 7.269 |
| 2.312212193041991 | 9.117 | -12.314 | 7.515 |
| 2.31849537834917 | 9.138 | -12.427 | 7.762 |
| 2.32477856365635 | 9.159 | -12.54 | 8.009 |
| 2.331061748963529 | 9.179 | -12.651 | 8.257 |
| 2.337344934270709 | 9.198 | -12.76 | 8.505 |
| 2.343628119577889 | 9.216 | -12.869 | 8.753 |
| 2.349911304885068 | 9.233 | -12.975 | 9.001 |
| 2.356194490192248 | 9.25 | -13.081 | 9.25 |
| 2.362477675499428 | 9.265 | -13.185 | 9.498 |
| 2.368760860806607 | 9.279 | -13.287 | 9.746 |
| 2.375044046113787 | 9.293 | -13.388 | 9.994 |
| 2.381327231420966 | 9.306 | -13.487 | 10.241 |
| 2.387610416728146 | 9.317 | -13.584 | 10.487 |
| 2.393893602035326 | 9.328 | -13.68 | 10.733 |
| 2.400176787342505 | 9.338 | -13.774 | 10.979 |
| 2.406459972649685 | 9.347 | -13.866 | 11.223 |
| 2.412743157956865 | 9.354 | -13.956 | 11.466 |
| 2.419026343264044 | 9.361 | -14.044 | 11.708 |
| 2.425309528571224 | 9.367 | -14.13 | 11.948 |
| 2.431592713878404 | 9.372 | -14.214 | 12.187 |
| 2.437875899185583 | 9.375 | -14.296 | 12.425 |
| 2.444159084492763 | 9.378 | -14.376 | 12.66 |
| 2.450442269799943 | 9.379 | -14.453 | 12.894 |
| 2.456725455107122 | 9.379 | -14.529 | 13.126 |
| 2.463008640414302 | 9.379 | -14.602 | 13.355 |
| 2.469291825721482 | 9.377 | -14.673 | 13.583 |
| 2.475575011028661 | 9.374 | -14.741 | 13.808 |
| 2.481858196335841 | 9.37 | -14.807 | 14.03 |
| 2.48814138164302 | 9.364 | -14.87 | 14.25 |
| 2.4944245669502 | 9.358 | -14.931 | 14.466 |
| 2.50070775225738 | 9.35 | -14.99 | 14.68 |
| 2.506990937564559 | 9.341 | -15.045 | 14.891 |
| 2.51327412287174 | 9.331 | -15.098 | 15.098 |
| 2.519557308178919 | 9.32 | -15.148 | 15.302 |
| 2.525840493486098 | 9.307 | -15.196 | 15.503 |
| 2.532123678793278 | 9.293 | -15.24 | 15.699 |
| 2.538406864100458 | 9.278 | -15.282 | 15.892 |
| 2.544690049407637 | 9.262 | -15.321 | 16.081 |
| 2.550973234714817 | 9.244 | -15.357 | 16.266 |
| 2.557256420021996 | 9.225 | -15.389 | 16.446 |
| 2.563539605329176 | 9.205 | -15.419 | 16.623 |
| 2.569822790636356 | 9.183 | -15.445 | 16.794 |
| 2.576105975943535 | 9.16 | -15.469 | 16.961 |
| 2.582389161250715 | 9.136 | -15.489 | 17.123 |
| 2.588672346557895 | 9.11 | -15.506 | 17.28 |
| 2.594955531865074 | 9.083 | -15.519 | 17.432 |
| 2.601238717172254 | 9.055 | -15.529 | 17.579 |
| 2.607521902479433 | 9.025 | -15.536 | 17.72 |
| 2.613805087786613 | 8.993 | -15.539 | 17.856 |
| 2.620088273093793 | 8.961 | -15.539 | 17.986 |
| 2.626371458400972 | 8.926 | -15.535 | 18.111 |
| 2.632654643708152 | 8.891 | -15.528 | 18.229 |
| 2.638937829015332 | 8.853 | -15.517 | 18.341 |
| 2.645221014322511 | 8.815 | -15.502 | 18.447 |
| 2.651504199629691 | 8.775 | -15.483 | 18.547 |
| 2.657787384936871 | 8.733 | -15.461 | 18.641 |
| 2.66407057024405 | 8.69 | -15.435 | 18.727 |
| 2.67035375555123 | 8.645 | -15.405 | 18.807 |
| 2.67663694085841 | 8.598 | -15.371 | 18.88 |
| 2.682920126165589 | 8.55 | -15.333 | 18.947 |
| 2.689203311472769 | 8.501 | -15.292 | 19.006 |
| 2.695486496779948 | 8.45 | -15.246 | 19.058 |
| 2.701769682087128 | 8.397 | -15.196 | 19.102 |
| 2.708052867394308 | 8.343 | -15.142 | 19.139 |
| 2.714336052701487 | 8.287 | -15.084 | 19.169 |
| 2.720619238008667 | 8.229 | -15.021 | 19.191 |
| 2.726902423315847 | 8.17 | -14.955 | 19.205 |
| 2.733185608623026 | 8.109 | -14.884 | 19.211 |
| 2.739468793930206 | 8.046 | -14.809 | 19.209 |
| 2.745751979237386 | 7.982 | -14.729 | 19.199 |
| 2.752035164544565 | 7.916 | -14.645 | 19.18 |
| 2.758318349851745 | 7.848 | -14.557 | 19.154 |
| 2.764601535158925 | 7.778 | -14.464 | 19.119 |
| 2.770884720466104 | 7.707 | -14.367 | 19.075 |
| 2.777167905773284 | 7.634 | -14.266 | 19.023 |
| 2.783451091080463 | 7.559 | -14.159 | 18.963 |
| 2.789734276387643 | 7.483 | -14.049 | 18.893 |
| 2.796017461694823 | 7.404 | -13.933 | 18.814 |
| 2.802300647002002 | 7.324 | -13.813 | 18.727 |
| 2.808583832309182 | 7.242 | -13.688 | 18.631 |
| 2.814867017616362 | 7.158 | -13.559 | 18.525 |
| 2.821150202923541 | 7.072 | -13.425 | 18.411 |
| 2.827433388230721 | 6.985 | -13.286 | 18.287 |
| 2.833716573537901 | 6.895 | -13.142 | 18.153 |
| 2.83999975884508 | 6.804 | -12.994 | 18.011 |
| 2.84628294415226 | 6.711 | -12.841 | 17.859 |
| 2.852566129459439 | 6.616 | -12.683 | 17.698 |
| 2.858849314766619 | 6.519 | -12.52 | 17.527 |
| 2.865132500073799 | 6.42 | -12.352 | 17.346 |
| 2.871415685380978 | 6.319 | -12.179 | 17.156 |
| 2.877698870688158 | 6.216 | -12.002 | 16.956 |
| 2.883982055995337 | 6.111 | -11.819 | 16.747 |
| 2.890265241302517 | 6.004 | -11.632 | 16.528 |
| 2.896548426609697 | 5.896 | -11.439 | 16.299 |
| 2.902831611916877 | 5.785 | -11.242 | 16.06 |
| 2.909114797224056 | 5.672 | -11.039 | 15.812 |
| 2.915397982531236 | 5.557 | -10.832 | 15.554 |
| 2.921681167838416 | 5.441 | -10.619 | 15.286 |
| 2.927964353145595 | 5.322 | -10.401 | 15.008 |
| 2.934247538452775 | 5.201 | -10.179 | 14.721 |
| 2.940530723759954 | 5.078 | -9.951 | 14.423 |
| 2.946813909067134 | 4.953 | -9.718 | 14.116 |
| 2.953097094374314 | 4.826 | -9.48 | 13.799 |
| 2.959380279681493 | 4.697 | -9.238 | 13.473 |
| 2.965663464988673 | 4.565 | -8.989 | 13.136 |
| 2.971946650295853 | 4.432 | -8.736 | 12.79 |
| 2.978229835603032 | 4.296 | -8.478 | 12.434 |
| 2.984513020910212 | 4.159 | -8.215 | 12.069 |
| 2.990796206217391 | 4.019 | -7.947 | 11.694 |
| 2.997079391524571 | 3.877 | -7.673 | 11.309 |
| 3.003362576831751 | 3.733 | -7.395 | 10.915 |
| 3.009645762138931 | 3.587 | -7.111 | 10.512 |
| 3.01592894744611 | 3.438 | -6.822 | 10.099 |
| 3.02221213275329 | 3.288 | -6.528 | 9.676 |
| 3.028495318060469 | 3.135 | -6.23 | 9.245 |
| 3.034778503367649 | 2.98 | -5.926 | 8.804 |
| 3.041061688674829 | 2.823 | -5.617 | 8.354 |
| 3.047344873982008 | 2.663 | -5.303 | 7.895 |
| 3.053628059289188 | 2.501 | -4.984 | 7.427 |
| 3.059911244596367 | 2.338 | -4.66 | 6.95 |
| 3.066194429903547 | 2.171 | -4.331 | 6.465 |
| 3.072477615210727 | 2.003 | -3.997 | 5.971 |
| 3.078760800517906 | 1.832 | -3.658 | 5.468 |
| 3.085043985825086 | 1.659 | -3.314 | 4.957 |
| 3.091327171132266 | 1.484 | -2.965 | 4.438 |
| 3.097610356439445 | 1.307 | -2.611 | 3.91 |
| 3.103893541746625 | 1.127 | -2.253 | 3.375 |
| 3.110176727053805 | 0.945 | -1.889 | 2.831 |
| 3.116459912360984 | 0.761 | -1.521 | 2.28 |
| 3.122743097668164 | 0.574 | -1.148 | 1.721 |
| 3.129026282975343 | 0.385 | -0.77 | 1.155 |
| 3.135309468282523 | 0.194 | -0.387 | 0.581 |
| 3.141592653589703 | 0 | 0 | 0 |
| 3.147875838896883 | -0.196 | 0.392 | -0.588 |
| 3.154159024204062 | -0.394 | 0.789 | -1.183 |
| 3.160442209511242 | -0.595 | 1.19 | -1.784 |
| 3.166725394818422 | -0.798 | 1.596 | -2.392 |
| 3.173008580125601 | -1.003 | 2.006 | -3.006 |
| 3.179291765432781 | -1.211 | 2.421 | -3.627 |
| 3.18557495073996 | -1.421 | 2.84 | -4.253 |
| 3.19185813604714 | -1.634 | 3.264 | -4.885 |
| 3.19814132135432 | -1.849 | 3.692 | -5.523 |
| 3.2044245066615 | -2.066 | 4.124 | -6.166 |
| 3.210707691968679 | -2.286 | 4.561 | -6.814 |
| 3.216990877275859 | -2.508 | 5.001 | -7.467 |
| 3.223274062583038 | -2.732 | 5.446 | -8.124 |
| 3.229557247890217 | -2.959 | 5.896 | -8.786 |
| 3.235840433197398 | -3.189 | 6.349 | -9.453 |
| 3.242123618504577 | -3.42 | 6.806 | -10.123 |
| 3.248406803811757 | -3.654 | 7.267 | -10.797 |
| 3.254689989118936 | -3.891 | 7.732 | -11.475 |
| 3.260973174426116 | -4.13 | 8.201 | -12.155 |
| 3.267256359733296 | -4.371 | 8.674 | -12.839 |
| 3.273539545040475 | -4.615 | 9.15 | -13.526 |
| 3.279822730347655 | -4.861 | 9.63 | -14.215 |
| 3.286105915654835 | -5.11 | 10.114 | -14.907 |
| 3.292389100962014 | -5.361 | 10.601 | -15.6 |
| 3.298672286269194 | -5.615 | 11.092 | -16.295 |
| 3.304955471576374 | -5.871 | 11.586 | -16.992 |
| 3.311238656883553 | -6.13 | 12.083 | -17.69 |
| 3.317521842190732 | -6.391 | 12.584 | -18.389 |
| 3.323805027497912 | -6.654 | 13.088 | -19.088 |
| 3.330088212805092 | -6.92 | 13.594 | -19.788 |
| 3.336371398112272 | -7.188 | 14.104 | -20.487 |
| 3.342654583419451 | -7.459 | 14.617 | -21.187 |
| 3.34893776872663 | -7.732 | 15.133 | -21.886 |
| 3.355220954033811 | -8.008 | 15.652 | -22.584 |
| 3.36150413934099 | -8.286 | 16.173 | -23.281 |
| 3.36778732464817 | -8.567 | 16.697 | -23.976 |
| 3.37407050995535 | -8.85 | 17.223 | -24.67 |
| 3.380353695262529 | -9.135 | 17.752 | -25.362 |
| 3.386636880569709 | -9.423 | 18.283 | -26.051 |
| 3.392920065876888 | -9.714 | 18.817 | -26.738 |
| 3.399203251184068 | -10.006 | 19.353 | -27.421 |
| 3.405486436491248 | -10.302 | 19.89 | -28.102 |
| 3.411769621798427 | -10.6 | 20.43 | -28.779 |
| 3.418052807105607 | -10.9 | 20.972 | -29.451 |
| 3.424335992412787 | -11.203 | 21.516 | -30.12 |
| 3.430619177719966 | -11.508 | 22.061 | -30.784 |
| 3.436902363027146 | -11.815 | 22.608 | -31.443 |
| 3.443185548334325 | -12.125 | 23.156 | -32.097 |
| 3.449468733641505 | -12.438 | 23.706 | -32.745 |
| 3.455751918948685 | -12.753 | 24.258 | -33.388 |
| 3.462035104255865 | -13.07 | 24.81 | -34.024 |
| 3.468318289563044 | -13.39 | 25.364 | -34.653 |
| 3.474601474870224 | -13.712 | 25.918 | -35.276 |
| 3.480884660177403 | -14.037 | 26.474 | -35.892 |
| 3.487167845484583 | -14.364 | 27.03 | -36.5 |
| 3.493451030791763 | -14.694 | 27.587 | -37.1 |
| 3.499734216098942 | -15.026 | 28.145 | -37.692 |
| 3.506017401406122 | -15.36 | 28.703 | -38.276 |
| 3.512300586713302 | -15.697 | 29.261 | -38.85 |
| 3.518583772020481 | -16.036 | 29.82 | -39.416 |
| 3.524866957327661 | -16.378 | 30.379 | -39.972 |
| 3.531150142634841 | -16.722 | 30.938 | -40.518 |
| 3.53743332794202 | -17.068 | 31.496 | -41.054 |
| 3.5437165132492 | -17.417 | 32.055 | -41.579 |
| 3.54999969855638 | -17.768 | 32.613 | -42.094 |
| 3.556282883863559 | -18.121 | 33.171 | -42.597 |
| 3.562566069170739 | -18.477 | 33.728 | -43.09 |
| 3.568849254477918 | -18.836 | 34.285 | -43.57 |
| 3.575132439785098 | -19.196 | 34.84 | -44.038 |
| 3.581415625092278 | -19.559 | 35.395 | -44.494 |
| 3.587698810399457 | -19.924 | 35.949 | -44.937 |
| 3.593981995706637 | -20.292 | 36.501 | -45.367 |
| 3.600265181013817 | -20.662 | 37.053 | -45.784 |
| 3.606548366320996 | -21.034 | 37.602 | -46.187 |
| 3.612831551628176 | -21.409 | 38.151 | -46.576 |
| 3.619114736935355 | -21.786 | 38.697 | -46.951 |
| 3.625397922242535 | -22.165 | 39.242 | -47.311 |
| 3.631681107549715 | -22.546 | 39.784 | -47.657 |
| 3.637964292856894 | -22.93 | 40.325 | -47.987 |
| 3.644247478164074 | -23.316 | 40.863 | -48.302 |
| 3.650530663471254 | -23.704 | 41.399 | -48.601 |
| 3.656813848778433 | -24.094 | 41.933 | -48.885 |
| 3.663097034085613 | -24.487 | 42.464 | -49.151 |
| 3.669380219392792 | -24.882 | 42.992 | -49.402 |
| 3.675663404699972 | -25.279 | 43.517 | -49.636 |
| 3.681946590007152 | -25.678 | 44.04 | -49.852 |
| 3.688229775314331 | -26.08 | 44.559 | -50.051 |
| 3.694512960621511 | -26.483 | 45.075 | -50.233 |
| 3.700796145928691 | -26.889 | 45.587 | -50.397 |
| 3.70707933123587 | -27.297 | 46.096 | -50.543 |
| 3.71336251654305 | -27.707 | 46.601 | -50.67 |
| 3.71964570185023 | -28.12 | 47.102 | -50.779 |
| 3.72592888715741 | -28.534 | 47.599 | -50.869 |
| 3.732212072464589 | -28.951 | 48.092 | -50.94 |
| 3.738495257771769 | -29.369 | 48.581 | -50.992 |
| 3.744778443078948 | -29.79 | 49.066 | -51.025 |
| 3.751061628386128 | -30.212 | 49.546 | -51.038 |
| 3.757344813693308 | -30.637 | 50.021 | -51.031 |
| 3.763627999000487 | -31.064 | 50.491 | -51.004 |
| 3.769911184307667 | -31.493 | 50.957 | -50.957 |
| 3.776194369614846 | -31.924 | 51.417 | -50.889 |
| 3.782477554922026 | -32.356 | 51.872 | -50.801 |
| 3.788760740229206 | -32.791 | 52.321 | -50.692 |
| 3.795043925536385 | -33.228 | 52.765 | -50.562 |
| 3.801327110843565 | -33.667 | 53.204 | -50.412 |
| 3.807610296150745 | -34.107 | 53.636 | -50.24 |
| 3.813893481457924 | -34.55 | 54.063 | -50.047 |
| 3.820176666765104 | -34.994 | 54.483 | -49.832 |
| 3.826459852072284 | -35.441 | 54.898 | -49.596 |
| 3.832743037379463 | -35.889 | 55.305 | -49.338 |
| 3.839026222686643 | -36.339 | 55.707 | -49.059 |
| 3.845309407993823 | -36.791 | 56.101 | -48.758 |
| 3.851592593301002 | -37.244 | 56.489 | -48.434 |
| 3.857875778608182 | -37.7 | 56.87 | -48.089 |
| 3.864158963915361 | -38.157 | 57.244 | -47.721 |
| 3.870442149222541 | -38.616 | 57.61 | -47.332 |
| 3.876725334529721 | -39.076 | 57.969 | -46.92 |
| 3.8830085198369 | -39.539 | 58.321 | -46.486 |
| 3.88929170514408 | -40.003 | 58.665 | -46.029 |
| 3.89557489045126 | -40.469 | 59.001 | -45.551 |
| 3.901858075758439 | -40.936 | 59.329 | -45.05 |
| 3.908141261065619 | -41.405 | 59.649 | -44.526 |
| 3.914424446372799 | -41.876 | 59.961 | -43.98 |
| 3.920707631679978 | -42.348 | 60.264 | -43.412 |
| 3.926990816987158 | -42.822 | 60.559 | -42.822 |
| 3.933274002294337 | -43.297 | 60.845 | -42.209 |
| 3.939557187601517 | -43.774 | 61.123 | -41.574 |
| 3.945840372908697 | -44.252 | 61.392 | -40.917 |
| 3.952123558215876 | -44.732 | 61.651 | -40.237 |
| 3.958406743523056 | -45.214 | 61.902 | -39.536 |
| 3.964689928830236 | -45.696 | 62.143 | -38.812 |
| 3.970973114137415 | -46.181 | 62.375 | -38.067 |
| 3.977256299444595 | -46.666 | 62.597 | -37.299 |
| 3.983539484751775 | -47.153 | 62.809 | -36.51 |
| 3.989822670058954 | -47.642 | 63.012 | -35.699 |
| 3.996105855366134 | -48.131 | 63.205 | -34.867 |
| 4.002389040673314 | -48.622 | 63.387 | -34.014 |
| 4.008672225980493 | -49.114 | 63.56 | -33.139 |
| 4.014955411287672 | -49.608 | 63.722 | -32.243 |
| 4.021238596594851 | -50.103 | 63.873 | -31.326 |
| 4.02752178190203 | -50.598 | 64.014 | -30.388 |
| 4.03380496720921 | -51.095 | 64.144 | -29.43 |
| 4.040088152516389 | -51.594 | 64.264 | -28.452 |
| 4.046371337823567 | -52.093 | 64.372 | -27.453 |
| 4.052654523130747 | -52.593 | 64.47 | -26.434 |
| 4.058937708437926 | -53.095 | 64.556 | -25.396 |
| 4.065220893745105 | -53.597 | 64.631 | -24.338 |
| 4.071504079052285 | -54.101 | 64.694 | -23.261 |
| 4.077787264359464 | -54.605 | 64.746 | -22.165 |
| 4.084070449666643 | -55.111 | 64.787 | -21.05 |
| 4.090353634973822 | -55.617 | 64.815 | -19.917 |
| 4.096636820281001 | -56.125 | 64.832 | -18.766 |
| 4.102920005588181 | -56.633 | 64.837 | -17.597 |
| 4.10920319089536 | -57.142 | 64.829 | -16.41 |
| 4.115486376202539 | -57.652 | 64.81 | -15.206 |
| 4.121769561509718 | -58.162 | 64.778 | -13.985 |
| 4.128052746816897 | -58.674 | 64.734 | -12.747 |
| 4.134335932124077 | -59.186 | 64.677 | -11.493 |
| 4.140619117431256 | -59.698 | 64.608 | -10.223 |
| 4.146902302738435 | -60.212 | 64.526 | -8.938 |
| 4.153185488045614 | -60.726 | 64.432 | -7.637 |
| 4.159468673352793 | -61.241 | 64.324 | -6.322 |
| 4.165751858659973 | -61.756 | 64.204 | -4.992 |
| 4.172035043967152 | -62.272 | 64.07 | -3.649 |
| 4.178318229274331 | -62.788 | 63.924 | -2.291 |
| 4.18460141458151 | -63.305 | 63.764 | -0.921 |
| 4.190884599888689 | -63.822 | 63.591 | 0.462 |
| 4.197167785195868 | -64.34 | 63.404 | 1.858 |
| 4.203450970503048 | -64.858 | 63.204 | 3.266 |
| 4.209734155810227 | -65.376 | 62.991 | 4.684 |
| 4.216017341117406 | -65.895 | 62.763 | 6.114 |
| 4.222300526424585 | -66.414 | 62.523 | 7.555 |
| 4.228583711731764 | -66.933 | 62.268 | 9.005 |
| 4.234866897038944 | -67.453 | 62 | 10.465 |
| 4.241150082346122 | -67.972 | 61.718 | 11.934 |
| 4.247433267653302 | -68.492 | 61.421 | 13.411 |
| 4.253716452960481 | -69.012 | 61.111 | 14.897 |
| 4.25999963826766 | -69.532 | 60.787 | 16.39 |
| 4.26628282357484 | -70.052 | 60.449 | 17.89 |
| 4.272566008882019 | -70.572 | 60.096 | 19.397 |
| 4.278849194189198 | -71.092 | 59.729 | 20.909 |
| 4.285132379496377 | -71.612 | 59.348 | 22.427 |
| 4.291415564803557 | -72.132 | 58.953 | 23.949 |
| 4.297698750110735 | -72.651 | 58.543 | 25.476 |
| 4.303981935417915 | -73.171 | 58.119 | 27.007 |
| 4.310265120725094 | -73.69 | 57.681 | 28.541 |
| 4.316548306032273 | -74.209 | 57.228 | 30.077 |
| 4.322831491339452 | -74.728 | 56.76 | 31.615 |
| 4.329114676646632 | -75.246 | 56.278 | 33.155 |
| 4.335397861953811 | -75.764 | 55.782 | 34.695 |
| 4.34168104726099 | -76.282 | 55.27 | 36.236 |
| 4.347964232568169 | -76.799 | 54.744 | 37.776 |
| 4.354247417875348 | -77.316 | 54.204 | 39.315 |
| 4.360530603182528 | -77.832 | 53.649 | 40.853 |
| 4.366813788489707 | -78.348 | 53.079 | 42.388 |
| 4.373096973796886 | -78.863 | 52.494 | 43.921 |
| 4.379380159104065 | -79.378 | 51.895 | 45.45 |
| 4.385663344411244 | -79.892 | 51.281 | 46.975 |
| 4.391946529718424 | -80.405 | 50.653 | 48.495 |
| 4.398229715025602 | -80.917 | 50.009 | 50.009 |
| 4.404512900332782 | -81.429 | 49.351 | 51.518 |
| 4.41079608563996 | -81.939 | 48.679 | 53.02 |
| 4.41707927094714 | -82.449 | 47.991 | 54.515 |
| 4.42336245625432 | -82.958 | 47.289 | 56.001 |
| 4.429645641561499 | -83.466 | 46.573 | 57.48 |
| 4.435928826868678 | -83.973 | 45.841 | 58.948 |
| 4.442212012175857 | -84.479 | 45.095 | 60.407 |
| 4.448495197483036 | -84.984 | 44.335 | 61.856 |
| 4.454778382790215 | -85.488 | 43.56 | 63.293 |
| 4.461061568097395 | -85.991 | 42.77 | 64.718 |
| 4.467344753404574 | -86.492 | 41.966 | 66.13 |
| 4.473627938711753 | -86.992 | 41.147 | 67.53 |
| 4.479911124018932 | -87.491 | 40.314 | 68.915 |
| 4.486194309326112 | -87.989 | 39.467 | 70.286 |
| 4.49247749463329 | -88.485 | 38.605 | 71.642 |
| 4.49876067994047 | -88.98 | 37.729 | 72.982 |
| 4.50504386524765 | -89.473 | 36.838 | 74.306 |
| 4.511327050554828 | -89.965 | 35.934 | 75.613 |
| 4.517610235862008 | -90.456 | 35.015 | 76.901 |
| 4.523893421169186 | -90.944 | 34.083 | 78.171 |
| 4.530176606476366 | -91.431 | 33.136 | 79.423 |
| 4.536459791783545 | -91.917 | 32.175 | 80.654 |
| 4.542742977090724 | -92.401 | 31.201 | 81.865 |
| 4.549026162397904 | -92.883 | 30.212 | 83.055 |
| 4.555309347705083 | -93.363 | 29.21 | 84.224 |
| 4.561592533012262 | -93.841 | 28.195 | 85.37 |
| 4.567875718319441 | -94.317 | 27.165 | 86.493 |
| 4.57415890362662 | -94.792 | 26.123 | 87.593 |
| 4.5804420889338 | -95.264 | 25.067 | 88.669 |
| 4.586725274240979 | -95.735 | 23.998 | 89.719 |
| 4.593008459548158 | -96.203 | 22.915 | 90.745 |
| 4.599291644855337 | -96.669 | 21.82 | 91.745 |
| 4.605574830162516 | -97.134 | 20.711 | 92.718 |
| 4.611858015469695 | -97.595 | 19.59 | 93.663 |
| 4.618141200776875 | -98.055 | 18.456 | 94.581 |
| 4.624424386084054 | -98.512 | 17.309 | 95.471 |
| 4.630707571391233 | -98.967 | 16.15 | 96.332 |
| 4.636990756698412 | -99.42 | 14.978 | 97.163 |
| 4.643273942005591 | -99.87 | 13.794 | 97.965 |
| 4.649557127312771 | -100.318 | 12.598 | 98.735 |
| 4.65584031261995 | -100.763 | 11.39 | 99.475 |
| 4.66212349792713 | -101.205 | 10.17 | 100.183 |
| 4.668406683234308 | -101.645 | 8.938 | 100.859 |
| 4.674689868541487 | -102.082 | 7.695 | 101.502 |
| 4.680973053848666 | -102.517 | 6.44 | 102.112 |
| 4.687256239155846 | -102.948 | 5.174 | 102.688 |
| 4.693539424463024 | -103.377 | 3.897 | 103.23 |
| 4.699822609770204 | -103.803 | 2.609 | 103.737 |
| 4.706105795077383 | -104.226 | 1.31 | 104.21 |
| 4.712388980384562 | -104.646 | 0 | 104.646 |
| 4.718672165691741 | -105.063 | -1.32 | 105.047 |
| 4.724955350998921 | -105.477 | -2.651 | 105.411 |
| 4.7312385363061 | -105.888 | -3.992 | 105.738 |
| 4.73752172161328 | -106.296 | -5.342 | 106.027 |
| 4.743804906920459 | -106.7 | -6.703 | 106.279 |
| 4.750088092227637 | -107.102 | -8.073 | 106.493 |
| 4.756371277534817 | -107.5 | -9.453 | 106.668 |
| 4.762654462841996 | -107.894 | -10.842 | 106.805 |
| 4.768937648149175 | -108.285 | -12.24 | 106.902 |
| 4.775220833456354 | -108.673 | -13.647 | 106.959 |
| 4.781504018763534 | -109.057 | -15.063 | 106.977 |
| 4.787787204070713 | -109.438 | -16.487 | 106.954 |
| 4.794070389377892 | -109.815 | -17.92 | 106.891 |
| 4.800353574685071 | -110.189 | -19.36 | 106.787 |
| 4.806636759992251 | -110.559 | -20.809 | 106.642 |
| 4.81291994529943 | -110.925 | -22.265 | 106.455 |
| 4.819203130606608 | -111.287 | -23.729 | 106.227 |
| 4.825486315913788 | -111.645 | -25.2 | 105.957 |
| 4.831769501220967 | -112 | -26.678 | 105.645 |
| 4.838052686528146 | -112.35 | -28.162 | 105.291 |
| 4.844335871835326 | -112.697 | -29.654 | 104.894 |
| 4.850619057142505 | -113.039 | -31.151 | 104.454 |
| 4.856902242449684 | -113.378 | -32.655 | 103.972 |
| 4.863185427756863 | -113.712 | -34.165 | 103.447 |
| 4.869468613064042 | -114.042 | -35.68 | 102.879 |
| 4.875751798371221 | -114.368 | -37.201 | 102.267 |
| 4.882034983678401 | -114.689 | -38.727 | 101.613 |
| 4.88831816898558 | -115.007 | -40.258 | 100.915 |
| 4.894601354292759 | -115.319 | -41.793 | 100.173 |
| 4.900884539599939 | -115.628 | -43.333 | 99.388 |
| 4.907167724907117 | -115.932 | -44.877 | 98.56 |
| 4.913450910214297 | -116.231 | -46.425 | 97.688 |
| 4.919734095521476 | -116.526 | -47.977 | 96.773 |
| 4.926017280828655 | -116.816 | -49.532 | 95.814 |
| 4.932300466135834 | -117.101 | -51.09 | 94.811 |
| 4.938583651443014 | -117.382 | -52.651 | 93.766 |
| 4.944866836750193 | -117.658 | -54.214 | 92.677 |
| 4.951150022057372 | -117.929 | -55.78 | 91.545 |
| 4.957433207364551 | -118.195 | -57.348 | 90.37 |
| 4.96371639267173 | -118.456 | -58.918 | 89.152 |
| 4.96999957797891 | -118.712 | -60.489 | 87.891 |
| 4.976282763286088 | -118.964 | -62.061 | 86.587 |
| 4.982565948593268 | -119.21 | -63.635 | 85.241 |
| 4.988849133900447 | -119.451 | -65.209 | 83.853 |
| 4.995132319207626 | -119.686 | -66.783 | 82.423 |
| 5.001415504514805 | -119.917 | -68.357 | 80.951 |
| 5.007698689821984 | -120.142 | -69.931 | 79.437 |
| 5.013981875129164 | -120.362 | -71.505 | 77.882 |
| 5.020265060436343 | -120.577 | -73.078 | 76.286 |
| 5.026548245743522 | -120.786 | -74.65 | 74.65 |
| 5.032831431050702 | -120.989 | -76.22 | 72.973 |
| 5.039114616357881 | -121.187 | -77.789 | 71.256 |
| 5.04539780166506 | -121.38 | -79.355 | 69.499 |
| 5.05168098697224 | -121.567 | -80.92 | 67.704 |
| 5.057964172279418 | -121.748 | -82.481 | 65.869 |
| 5.064247357586598 | -121.923 | -84.04 | 63.996 |
| 5.070530542893777 | -122.093 | -85.596 | 62.085 |
| 5.076813728200956 | -122.257 | -87.148 | 60.136 |
| 5.083096913508135 | -122.415 | -88.696 | 58.15 |
| 5.089380098815314 | -122.567 | -90.24 | 56.128 |
| 5.095663284122493 | -122.713 | -91.779 | 54.07 |
| 5.101946469429673 | -122.853 | -93.314 | 51.976 |
| 5.108229654736852 | -122.987 | -94.844 | 49.847 |
| 5.114512840044031 | -123.115 | -96.368 | 47.683 |
| 5.12079602535121 | -123.236 | -97.886 | 45.486 |
| 5.12707921065839 | -123.352 | -99.398 | 43.255 |
| 5.133362395965568 | -123.461 | -100.904 | 40.992 |
| 5.139645581272747 | -123.564 | -102.404 | 38.697 |
| 5.145928766579927 | -123.66 | -103.896 | 36.37 |
| 5.152211951887106 | -123.75 | -105.381 | 34.013 |
| 5.158495137194286 | -123.834 | -106.858 | 31.625 |
| 5.164778322501465 | -123.911 | -108.327 | 29.208 |
| 5.171061507808644 | -123.982 | -109.788 | 26.763 |
| 5.177344693115823 | -124.046 | -111.24 | 24.289 |
| 5.183627878423002 | -124.103 | -112.683 | 21.789 |
| 5.189911063730181 | -124.154 | -114.117 | 19.262 |
| 5.196194249037361 | -124.198 | -115.541 | 16.709 |
| 5.20247743434454 | -124.235 | -116.955 | 14.132 |
| 5.20876061965172 | -124.265 | -118.359 | 11.53 |
| 5.215043804958898 | -124.288 | -119.753 | 8.906 |
| 5.221326990266077 | -124.305 | -121.135 | 6.259 |
| 5.227610175573257 | -124.314 | -122.506 | 3.59 |
| 5.233893360880435 | -124.317 | -123.865 | 0.901 |
| 5.240176546187615 | -124.312 | -125.213 | -1.808 |
| 5.246459731494794 | -124.3 | -126.548 | -4.536 |
| 5.252742916801973 | -124.281 | -127.871 | -7.282 |
| 5.259026102109152 | -124.255 | -129.18 | -10.045 |
| 5.265309287416332 | -124.222 | -130.476 | -12.824 |
| 5.27159247272351 | -124.181 | -131.759 | -15.618 |
| 5.27787565803069 | -124.133 | -133.028 | -18.427 |
| 5.284158843337869 | -124.078 | -134.283 | -21.248 |
| 5.290442028645049 | -124.015 | -135.523 | -24.082 |
| 5.296725213952227 | -123.945 | -136.748 | -26.927 |
| 5.303008399259407 | -123.867 | -137.957 | -29.783 |
| 5.309291584566586 | -123.782 | -139.152 | -32.648 |
| 5.315574769873765 | -123.689 | -140.33 | -35.521 |
| 5.321857955180945 | -123.589 | -141.492 | -38.401 |
| 5.328141140488124 | -123.48 | -142.638 | -41.287 |
| 5.334424325795303 | -123.364 | -143.767 | -44.178 |
| 5.340707511102482 | -123.241 | -144.878 | -47.074 |
| 5.346990696409661 | -123.109 | -145.972 | -49.972 |
| 5.35327388171684 | -122.97 | -147.048 | -52.872 |
| 5.35955706702402 | -122.822 | -148.107 | -55.773 |
| 5.365840252331199 | -122.667 | -149.146 | -58.674 |
| 5.372123437638378 | -122.504 | -150.167 | -61.573 |
| 5.378406622945557 | -122.333 | -151.169 | -64.47 |
| 5.384689808252737 | -122.153 | -152.151 | -67.363 |
| 5.390972993559916 | -121.966 | -153.114 | -70.251 |
| 5.397256178867095 | -121.771 | -154.057 | -73.133 |
| 5.403539364174274 | -121.567 | -154.979 | -76.008 |
| 5.409822549481453 | -121.355 | -155.881 | -78.875 |
| 5.416105734788632 | -121.135 | -156.762 | -81.733 |
| 5.422388920095812 | -120.906 | -157.621 | -84.58 |
| 5.42867210540299 | -120.669 | -158.46 | -87.415 |
| 5.43495529071017 | -120.424 | -159.276 | -90.238 |
| 5.44123847601735 | -120.17 | -160.07 | -93.046 |
| 5.447521661324528 | -119.908 | -160.842 | -95.84 |
| 5.453804846631708 | -119.638 | -161.591 | -98.617 |
| 5.460088031938887 | -119.359 | -162.317 | -101.377 |
| 5.466371217246066 | -119.071 | -163.019 | -104.118 |
| 5.472654402553245 | -118.775 | -163.699 | -106.839 |
| 5.478937587860424 | -118.47 | -164.354 | -109.54 |
| 5.485220773167603 | -118.156 | -164.985 | -112.218 |
| 5.491503958474783 | -117.834 | -165.592 | -114.873 |
| 5.497787143781962 | -117.503 | -166.174 | -117.503 |
| 5.504070329089141 | -117.163 | -166.731 | -120.108 |
| 5.51035351439632 | -116.814 | -167.264 | -122.686 |
| 5.5166366997035 | -116.457 | -167.77 | -125.236 |
| 5.522919885010679 | -116.091 | -168.251 | -127.756 |
| 5.529203070317858 | -115.715 | -168.706 | -130.247 |
| 5.535486255625037 | -115.331 | -169.134 | -132.706 |
| 5.541769440932216 | -114.938 | -169.536 | -135.133 |
| 5.548052626239396 | -114.536 | -169.912 | -137.526 |
| 5.554335811546575 | -114.124 | -170.26 | -139.884 |
| 5.560618996853754 | -113.704 | -170.581 | -142.206 |
| 5.566902182160933 | -113.275 | -170.875 | -144.491 |
| 5.573185367468112 | -112.836 | -171.141 | -146.738 |
| 5.579468552775292 | -112.388 | -171.379 | -148.945 |
| 5.585751738082471 | -111.931 | -171.589 | -151.112 |
| 5.59203492338965 | -111.465 | -171.77 | -153.238 |
| 5.59831810869683 | -110.989 | -171.923 | -155.321 |
| 5.604601294004008 | -110.505 | -172.047 | -157.36 |
| 5.610884479311188 | -110.01 | -172.142 | -159.355 |
| 5.617167664618367 | -109.507 | -172.208 | -161.304 |
| 5.623450849925546 | -108.994 | -172.245 | -163.206 |
| 5.629734035232725 | -108.472 | -172.251 | -165.06 |
| 5.636017220539904 | -107.94 | -172.228 | -166.865 |
| 5.642300405847083 | -107.399 | -172.175 | -168.621 |
| 5.648583591154263 | -106.849 | -172.092 | -170.325 |
| 5.654866776461442 | -106.288 | -171.978 | -171.978 |
| 5.661149961768621 | -105.719 | -171.834 | -173.578 |
| 5.6674331470758 | -105.139 | -171.659 | -175.124 |
| 5.673716332382979 | -104.551 | -171.453 | -176.616 |
| 5.679999517690159 | -103.952 | -171.216 | -178.052 |
| 5.686282702997337 | -103.344 | -170.948 | -179.431 |
| 5.692565888304517 | -102.726 | -170.648 | -180.753 |
| 5.698849073611696 | -102.099 | -170.317 | -182.017 |
| 5.705132258918875 | -101.462 | -169.955 | -183.221 |
| 5.711415444226055 | -100.815 | -169.56 | -184.366 |
| 5.717698629533234 | -100.159 | -169.133 | -185.45 |
| 5.723981814840413 | -99.492 | -168.675 | -186.472 |
| 5.730265000147592 | -98.816 | -168.184 | -187.431 |
| 5.73654818545477 | -98.13 | -167.661 | -188.328 |
| 5.742831370761951 | -97.434 | -167.105 | -189.16 |
| 5.74911455606913 | -96.729 | -166.517 | -189.928 |
| 5.75539774137631 | -96.013 | -165.896 | -190.63 |
| 5.761680926683488 | -95.288 | -165.243 | -191.267 |
| 5.767964111990667 | -94.553 | -164.557 | -191.836 |
| 5.774247297297846 | -93.808 | -163.837 | -192.338 |
| 5.780530482605025 | -93.053 | -163.085 | -192.773 |
| 5.786813667912205 | -92.287 | -162.3 | -193.138 |
| 5.793096853219384 | -91.512 | -161.481 | -193.435 |
| 5.799380038526563 | -90.727 | -160.63 | -193.661 |
| 5.805663223833742 | -89.932 | -159.745 | -193.818 |
| 5.811946409140922 | -89.127 | -158.826 | -193.903 |
| 5.8182295944481 | -88.312 | -157.875 | -193.917 |
| 5.82451277975528 | -87.487 | -156.89 | -193.86 |
| 5.830795965062459 | -86.652 | -155.871 | -193.73 |
| 5.837079150369638 | -85.807 | -154.819 | -193.528 |
| 5.843362335676817 | -84.952 | -153.734 | -193.253 |
| 5.849645520983997 | -84.087 | -152.614 | -192.904 |
| 5.855928706291176 | -83.211 | -151.462 | -192.482 |
| 5.862211891598355 | -82.326 | -150.276 | -191.985 |
| 5.868495076905535 | -81.43 | -149.056 | -191.415 |
| 5.874778262212714 | -80.524 | -147.803 | -190.77 |
| 5.881061447519893 | -79.608 | -146.516 | -190.05 |
| 5.887344632827072 | -78.682 | -145.196 | -189.255 |
| 5.893627818134251 | -77.746 | -143.842 | -188.385 |
| 5.899911003441431 | -76.8 | -142.455 | -187.439 |
| 5.90619418874861 | -75.843 | -141.035 | -186.418 |
| 5.912477374055789 | -74.877 | -139.581 | -185.322 |
| 5.918760559362968 | -73.9 | -138.094 | -184.15 |
| 5.925043744670147 | -72.913 | -136.573 | -182.903 |
| 5.931326929977326 | -71.916 | -135.02 | -181.579 |
| 5.937610115284505 | -70.909 | -133.433 | -180.181 |
| 5.943893300591684 | -69.891 | -131.813 | -178.706 |
| 5.950176485898864 | -68.863 | -130.161 | -177.156 |
| 5.956459671206043 | -67.826 | -128.475 | -175.531 |
| 5.962742856513223 | -66.778 | -126.757 | -173.831 |
| 5.969026041820402 | -65.719 | -125.005 | -172.055 |
| 5.975309227127581 | -64.651 | -123.222 | -170.205 |
| 5.98159241243476 | -63.572 | -121.406 | -168.28 |
| 5.987875597741939 | -62.483 | -119.557 | -166.281 |
| 5.994158783049118 | -61.385 | -117.677 | -164.207 |
| 6.000441968356298 | -60.275 | -115.764 | -162.06 |
| 6.006725153663476 | -59.156 | -113.82 | -159.839 |
| 6.013008338970656 | -58.027 | -111.843 | -157.545 |
| 6.019291524277835 | -56.887 | -109.835 | -155.179 |
| 6.025574709585015 | -55.737 | -107.796 | -152.74 |
| 6.031857894892193 | -54.577 | -105.725 | -150.23 |
| 6.038141080199372 | -53.407 | -103.623 | -147.648 |
| 6.044424265506552 | -52.227 | -101.491 | -144.996 |
| 6.050707450813731 | -51.037 | -99.327 | -142.274 |
| 6.05699063612091 | -49.836 | -97.133 | -139.482 |
| 6.06327382142809 | -48.625 | -94.909 | -136.621 |
| 6.069557006735269 | -47.405 | -92.654 | -133.691 |
| 6.075840192042448 | -46.174 | -90.37 | -130.694 |
| 6.082123377349627 | -44.933 | -88.056 | -127.631 |
| 6.088406562656806 | -43.682 | -85.712 | -124.501 |
| 6.094689747963986 | -42.421 | -83.339 | -121.305 |
| 6.100972933271164 | -41.15 | -80.937 | -118.045 |
| 6.107256118578344 | -39.869 | -78.507 | -114.721 |
| 6.113539303885523 | -38.578 | -76.048 | -111.335 |
| 6.119822489192702 | -37.277 | -73.561 | -107.886 |
| 6.126105674499882 | -35.965 | -71.045 | -104.376 |
| 6.132388859807061 | -34.644 | -68.502 | -100.806 |
| 6.13867204511424 | -33.313 | -65.932 | -97.176 |
| 6.144955230421419 | -31.972 | -63.335 | -93.489 |
| 6.151238415728598 | -30.621 | -60.711 | -89.744 |
| 6.157521601035778 | -29.261 | -58.06 | -85.943 |
| 6.163804786342957 | -27.89 | -55.383 | -82.088 |
| 6.170087971650136 | -26.509 | -52.68 | -78.178 |
| 6.176371156957315 | -25.119 | -49.952 | -74.215 |
| 6.182654342264494 | -23.719 | -47.198 | -70.201 |
| 6.188937527571674 | -22.309 | -44.42 | -66.136 |
| 6.195220712878853 | -20.889 | -41.617 | -62.022 |
| 6.201503898186032 | -19.459 | -38.789 | -57.86 |
| 6.207787083493211 | -18.02 | -35.938 | -53.652 |
| 6.21407026880039 | -16.571 | -33.063 | -49.398 |
| 6.22035345410757 | -15.113 | -30.166 | -45.099 |
| 6.226636639414749 | -13.644 | -27.245 | -40.759 |
| 6.232919824721928 | -12.166 | -24.302 | -36.376 |
| 6.239203010029107 | -10.679 | -21.337 | -31.954 |
| 6.245486195336286 | -9.182 | -18.351 | -27.493 |
| 6.251769380643465 | -7.675 | -15.343 | -22.995 |
| 6.258052565950644 | -6.159 | -12.314 | -18.462 |
| 6.264335751257824 | -4.633 | -9.265 | -13.894 |
| 6.270618936565003 | -3.098 | -6.196 | -9.293 |
| 6.276902121872182 | -1.554 | -3.108 | -4.661 |
| 6.283185307179361 | 0 | 0 | 0 |